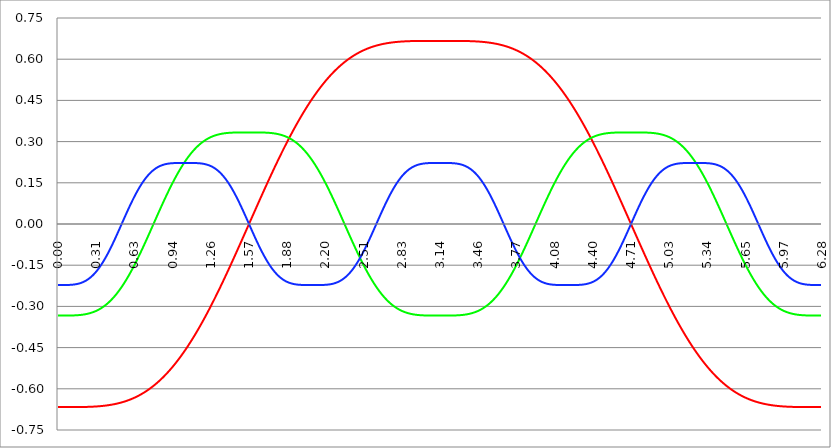
| Category | Series 1 | Series 0 | Series 2 |
|---|---|---|---|
| 0.0 | -0.667 | -0.333 | -0.222 |
| 0.00314159265358979 | -0.667 | -0.333 | -0.222 |
| 0.00628318530717958 | -0.667 | -0.333 | -0.222 |
| 0.00942477796076938 | -0.667 | -0.333 | -0.222 |
| 0.0125663706143592 | -0.667 | -0.333 | -0.222 |
| 0.015707963267949 | -0.667 | -0.333 | -0.222 |
| 0.0188495559215388 | -0.667 | -0.333 | -0.222 |
| 0.0219911485751285 | -0.667 | -0.333 | -0.222 |
| 0.0251327412287183 | -0.667 | -0.333 | -0.222 |
| 0.0282743338823081 | -0.667 | -0.333 | -0.222 |
| 0.0314159265358979 | -0.667 | -0.333 | -0.222 |
| 0.0345575191894877 | -0.667 | -0.333 | -0.222 |
| 0.0376991118430775 | -0.667 | -0.333 | -0.222 |
| 0.0408407044966673 | -0.667 | -0.333 | -0.222 |
| 0.0439822971502571 | -0.667 | -0.333 | -0.222 |
| 0.0471238898038469 | -0.667 | -0.333 | -0.222 |
| 0.0502654824574367 | -0.667 | -0.333 | -0.222 |
| 0.0534070751110265 | -0.667 | -0.333 | -0.222 |
| 0.0565486677646163 | -0.667 | -0.333 | -0.222 |
| 0.059690260418206 | -0.667 | -0.333 | -0.222 |
| 0.0628318530717958 | -0.667 | -0.333 | -0.222 |
| 0.0659734457253856 | -0.667 | -0.333 | -0.222 |
| 0.0691150383789754 | -0.667 | -0.333 | -0.222 |
| 0.0722566310325652 | -0.667 | -0.333 | -0.222 |
| 0.075398223686155 | -0.667 | -0.333 | -0.222 |
| 0.0785398163397448 | -0.667 | -0.333 | -0.222 |
| 0.0816814089933346 | -0.667 | -0.333 | -0.222 |
| 0.0848230016469244 | -0.667 | -0.333 | -0.222 |
| 0.0879645943005142 | -0.667 | -0.333 | -0.222 |
| 0.091106186954104 | -0.667 | -0.333 | -0.222 |
| 0.0942477796076937 | -0.667 | -0.333 | -0.222 |
| 0.0973893722612835 | -0.667 | -0.333 | -0.222 |
| 0.100530964914873 | -0.667 | -0.333 | -0.222 |
| 0.103672557568463 | -0.667 | -0.333 | -0.221 |
| 0.106814150222053 | -0.667 | -0.333 | -0.221 |
| 0.109955742875643 | -0.667 | -0.333 | -0.221 |
| 0.113097335529233 | -0.667 | -0.333 | -0.221 |
| 0.116238928182822 | -0.667 | -0.333 | -0.221 |
| 0.119380520836412 | -0.667 | -0.333 | -0.221 |
| 0.122522113490002 | -0.667 | -0.333 | -0.221 |
| 0.125663706143592 | -0.667 | -0.333 | -0.221 |
| 0.128805298797181 | -0.667 | -0.333 | -0.22 |
| 0.131946891450771 | -0.667 | -0.333 | -0.22 |
| 0.135088484104361 | -0.667 | -0.333 | -0.22 |
| 0.138230076757951 | -0.667 | -0.333 | -0.22 |
| 0.141371669411541 | -0.667 | -0.333 | -0.22 |
| 0.14451326206513 | -0.667 | -0.332 | -0.219 |
| 0.14765485471872 | -0.667 | -0.332 | -0.219 |
| 0.15079644737231 | -0.667 | -0.332 | -0.219 |
| 0.1539380400259 | -0.667 | -0.332 | -0.219 |
| 0.15707963267949 | -0.667 | -0.332 | -0.218 |
| 0.160221225333079 | -0.667 | -0.332 | -0.218 |
| 0.163362817986669 | -0.666 | -0.332 | -0.218 |
| 0.166504410640259 | -0.666 | -0.332 | -0.217 |
| 0.169646003293849 | -0.666 | -0.332 | -0.217 |
| 0.172787595947439 | -0.666 | -0.332 | -0.217 |
| 0.175929188601028 | -0.666 | -0.331 | -0.216 |
| 0.179070781254618 | -0.666 | -0.331 | -0.216 |
| 0.182212373908208 | -0.666 | -0.331 | -0.215 |
| 0.185353966561798 | -0.666 | -0.331 | -0.215 |
| 0.188495559215388 | -0.666 | -0.331 | -0.215 |
| 0.191637151868977 | -0.666 | -0.331 | -0.214 |
| 0.194778744522567 | -0.666 | -0.331 | -0.214 |
| 0.197920337176157 | -0.666 | -0.33 | -0.213 |
| 0.201061929829747 | -0.666 | -0.33 | -0.212 |
| 0.204203522483336 | -0.666 | -0.33 | -0.212 |
| 0.207345115136926 | -0.666 | -0.33 | -0.211 |
| 0.210486707790516 | -0.666 | -0.33 | -0.211 |
| 0.213628300444106 | -0.666 | -0.329 | -0.21 |
| 0.216769893097696 | -0.666 | -0.329 | -0.209 |
| 0.219911485751285 | -0.666 | -0.329 | -0.209 |
| 0.223053078404875 | -0.666 | -0.329 | -0.208 |
| 0.226194671058465 | -0.666 | -0.328 | -0.207 |
| 0.229336263712055 | -0.666 | -0.328 | -0.206 |
| 0.232477856365645 | -0.666 | -0.328 | -0.205 |
| 0.235619449019234 | -0.666 | -0.328 | -0.205 |
| 0.238761041672824 | -0.666 | -0.327 | -0.204 |
| 0.241902634326414 | -0.666 | -0.327 | -0.203 |
| 0.245044226980004 | -0.666 | -0.327 | -0.202 |
| 0.248185819633594 | -0.666 | -0.326 | -0.201 |
| 0.251327412287183 | -0.666 | -0.326 | -0.2 |
| 0.254469004940773 | -0.666 | -0.326 | -0.199 |
| 0.257610597594363 | -0.666 | -0.325 | -0.198 |
| 0.260752190247953 | -0.666 | -0.325 | -0.197 |
| 0.263893782901543 | -0.665 | -0.324 | -0.196 |
| 0.267035375555132 | -0.665 | -0.324 | -0.195 |
| 0.270176968208722 | -0.665 | -0.324 | -0.193 |
| 0.273318560862312 | -0.665 | -0.323 | -0.192 |
| 0.276460153515902 | -0.665 | -0.323 | -0.191 |
| 0.279601746169492 | -0.665 | -0.322 | -0.19 |
| 0.282743338823082 | -0.665 | -0.322 | -0.188 |
| 0.285884931476671 | -0.665 | -0.321 | -0.187 |
| 0.289026524130261 | -0.665 | -0.321 | -0.186 |
| 0.292168116783851 | -0.665 | -0.32 | -0.184 |
| 0.295309709437441 | -0.665 | -0.32 | -0.183 |
| 0.298451302091031 | -0.665 | -0.319 | -0.181 |
| 0.30159289474462 | -0.665 | -0.319 | -0.18 |
| 0.30473448739821 | -0.665 | -0.318 | -0.178 |
| 0.3078760800518 | -0.664 | -0.318 | -0.177 |
| 0.31101767270539 | -0.664 | -0.317 | -0.175 |
| 0.31415926535898 | -0.664 | -0.316 | -0.173 |
| 0.31730085801257 | -0.664 | -0.316 | -0.172 |
| 0.320442450666159 | -0.664 | -0.315 | -0.17 |
| 0.323584043319749 | -0.664 | -0.314 | -0.168 |
| 0.326725635973339 | -0.664 | -0.314 | -0.166 |
| 0.329867228626929 | -0.664 | -0.313 | -0.165 |
| 0.333008821280519 | -0.664 | -0.312 | -0.163 |
| 0.336150413934108 | -0.664 | -0.311 | -0.161 |
| 0.339292006587698 | -0.663 | -0.311 | -0.159 |
| 0.342433599241288 | -0.663 | -0.31 | -0.157 |
| 0.345575191894878 | -0.663 | -0.309 | -0.155 |
| 0.348716784548468 | -0.663 | -0.308 | -0.153 |
| 0.351858377202058 | -0.663 | -0.307 | -0.151 |
| 0.354999969855647 | -0.663 | -0.306 | -0.149 |
| 0.358141562509237 | -0.663 | -0.306 | -0.147 |
| 0.361283155162827 | -0.663 | -0.305 | -0.145 |
| 0.364424747816417 | -0.662 | -0.304 | -0.142 |
| 0.367566340470007 | -0.662 | -0.303 | -0.14 |
| 0.370707933123597 | -0.662 | -0.302 | -0.138 |
| 0.373849525777186 | -0.662 | -0.301 | -0.136 |
| 0.376991118430776 | -0.662 | -0.3 | -0.133 |
| 0.380132711084366 | -0.662 | -0.299 | -0.131 |
| 0.383274303737956 | -0.662 | -0.298 | -0.129 |
| 0.386415896391546 | -0.661 | -0.297 | -0.126 |
| 0.389557489045135 | -0.661 | -0.296 | -0.124 |
| 0.392699081698725 | -0.661 | -0.295 | -0.121 |
| 0.395840674352315 | -0.661 | -0.294 | -0.119 |
| 0.398982267005905 | -0.661 | -0.292 | -0.116 |
| 0.402123859659495 | -0.66 | -0.291 | -0.114 |
| 0.405265452313085 | -0.66 | -0.29 | -0.111 |
| 0.408407044966674 | -0.66 | -0.289 | -0.109 |
| 0.411548637620264 | -0.66 | -0.288 | -0.106 |
| 0.414690230273854 | -0.66 | -0.286 | -0.103 |
| 0.417831822927444 | -0.659 | -0.285 | -0.101 |
| 0.420973415581034 | -0.659 | -0.284 | -0.098 |
| 0.424115008234623 | -0.659 | -0.282 | -0.095 |
| 0.427256600888213 | -0.659 | -0.281 | -0.092 |
| 0.430398193541803 | -0.659 | -0.28 | -0.09 |
| 0.433539786195393 | -0.658 | -0.278 | -0.087 |
| 0.436681378848983 | -0.658 | -0.277 | -0.084 |
| 0.439822971502573 | -0.658 | -0.276 | -0.081 |
| 0.442964564156162 | -0.658 | -0.274 | -0.078 |
| 0.446106156809752 | -0.657 | -0.273 | -0.075 |
| 0.449247749463342 | -0.657 | -0.271 | -0.073 |
| 0.452389342116932 | -0.657 | -0.27 | -0.07 |
| 0.455530934770522 | -0.657 | -0.268 | -0.067 |
| 0.458672527424111 | -0.656 | -0.267 | -0.064 |
| 0.461814120077701 | -0.656 | -0.265 | -0.061 |
| 0.464955712731291 | -0.656 | -0.263 | -0.058 |
| 0.468097305384881 | -0.656 | -0.262 | -0.055 |
| 0.471238898038471 | -0.655 | -0.26 | -0.052 |
| 0.474380490692061 | -0.655 | -0.258 | -0.049 |
| 0.47752208334565 | -0.655 | -0.257 | -0.046 |
| 0.48066367599924 | -0.654 | -0.255 | -0.043 |
| 0.48380526865283 | -0.654 | -0.253 | -0.04 |
| 0.48694686130642 | -0.654 | -0.251 | -0.036 |
| 0.49008845396001 | -0.653 | -0.25 | -0.033 |
| 0.493230046613599 | -0.653 | -0.248 | -0.03 |
| 0.496371639267189 | -0.653 | -0.246 | -0.027 |
| 0.499513231920779 | -0.652 | -0.244 | -0.024 |
| 0.502654824574369 | -0.652 | -0.242 | -0.021 |
| 0.505796417227959 | -0.652 | -0.24 | -0.018 |
| 0.508938009881549 | -0.651 | -0.238 | -0.015 |
| 0.512079602535138 | -0.651 | -0.236 | -0.012 |
| 0.515221195188728 | -0.651 | -0.235 | -0.008 |
| 0.518362787842318 | -0.65 | -0.233 | -0.005 |
| 0.521504380495908 | -0.65 | -0.231 | -0.002 |
| 0.524645973149498 | -0.649 | -0.228 | 0.001 |
| 0.527787565803087 | -0.649 | -0.226 | 0.004 |
| 0.530929158456677 | -0.649 | -0.224 | 0.007 |
| 0.534070751110267 | -0.648 | -0.222 | 0.01 |
| 0.537212343763857 | -0.648 | -0.22 | 0.014 |
| 0.540353936417447 | -0.647 | -0.218 | 0.017 |
| 0.543495529071037 | -0.647 | -0.216 | 0.02 |
| 0.546637121724626 | -0.646 | -0.214 | 0.023 |
| 0.549778714378216 | -0.646 | -0.211 | 0.026 |
| 0.552920307031806 | -0.646 | -0.209 | 0.029 |
| 0.556061899685396 | -0.645 | -0.207 | 0.032 |
| 0.559203492338986 | -0.645 | -0.205 | 0.035 |
| 0.562345084992576 | -0.644 | -0.202 | 0.038 |
| 0.565486677646165 | -0.644 | -0.2 | 0.042 |
| 0.568628270299755 | -0.643 | -0.198 | 0.045 |
| 0.571769862953345 | -0.643 | -0.195 | 0.048 |
| 0.574911455606935 | -0.642 | -0.193 | 0.051 |
| 0.578053048260525 | -0.642 | -0.191 | 0.054 |
| 0.581194640914114 | -0.641 | -0.188 | 0.057 |
| 0.584336233567704 | -0.641 | -0.186 | 0.06 |
| 0.587477826221294 | -0.64 | -0.183 | 0.063 |
| 0.590619418874884 | -0.64 | -0.181 | 0.066 |
| 0.593761011528474 | -0.639 | -0.178 | 0.069 |
| 0.596902604182064 | -0.638 | -0.176 | 0.072 |
| 0.600044196835653 | -0.638 | -0.173 | 0.074 |
| 0.603185789489243 | -0.637 | -0.171 | 0.077 |
| 0.606327382142833 | -0.637 | -0.168 | 0.08 |
| 0.609468974796423 | -0.636 | -0.165 | 0.083 |
| 0.612610567450013 | -0.636 | -0.163 | 0.086 |
| 0.615752160103602 | -0.635 | -0.16 | 0.089 |
| 0.618893752757192 | -0.634 | -0.158 | 0.092 |
| 0.622035345410782 | -0.634 | -0.155 | 0.094 |
| 0.625176938064372 | -0.633 | -0.152 | 0.097 |
| 0.628318530717962 | -0.633 | -0.15 | 0.1 |
| 0.631460123371551 | -0.632 | -0.147 | 0.102 |
| 0.634601716025141 | -0.631 | -0.144 | 0.105 |
| 0.637743308678731 | -0.631 | -0.141 | 0.108 |
| 0.640884901332321 | -0.63 | -0.139 | 0.11 |
| 0.644026493985911 | -0.629 | -0.136 | 0.113 |
| 0.647168086639501 | -0.629 | -0.133 | 0.115 |
| 0.65030967929309 | -0.628 | -0.13 | 0.118 |
| 0.65345127194668 | -0.627 | -0.127 | 0.121 |
| 0.65659286460027 | -0.626 | -0.125 | 0.123 |
| 0.65973445725386 | -0.626 | -0.122 | 0.125 |
| 0.66287604990745 | -0.625 | -0.119 | 0.128 |
| 0.666017642561039 | -0.624 | -0.116 | 0.13 |
| 0.669159235214629 | -0.624 | -0.113 | 0.133 |
| 0.672300827868219 | -0.623 | -0.11 | 0.135 |
| 0.675442420521809 | -0.622 | -0.107 | 0.137 |
| 0.678584013175399 | -0.621 | -0.104 | 0.139 |
| 0.681725605828989 | -0.62 | -0.101 | 0.142 |
| 0.684867198482578 | -0.62 | -0.099 | 0.144 |
| 0.688008791136168 | -0.619 | -0.096 | 0.146 |
| 0.691150383789758 | -0.618 | -0.093 | 0.148 |
| 0.694291976443348 | -0.617 | -0.09 | 0.15 |
| 0.697433569096938 | -0.616 | -0.087 | 0.152 |
| 0.700575161750528 | -0.616 | -0.084 | 0.154 |
| 0.703716754404117 | -0.615 | -0.081 | 0.156 |
| 0.706858347057707 | -0.614 | -0.078 | 0.158 |
| 0.709999939711297 | -0.613 | -0.075 | 0.16 |
| 0.713141532364887 | -0.612 | -0.072 | 0.162 |
| 0.716283125018477 | -0.611 | -0.068 | 0.164 |
| 0.719424717672066 | -0.61 | -0.065 | 0.166 |
| 0.722566310325656 | -0.609 | -0.062 | 0.168 |
| 0.725707902979246 | -0.609 | -0.059 | 0.169 |
| 0.728849495632836 | -0.608 | -0.056 | 0.171 |
| 0.731991088286426 | -0.607 | -0.053 | 0.173 |
| 0.735132680940016 | -0.606 | -0.05 | 0.174 |
| 0.738274273593605 | -0.605 | -0.047 | 0.176 |
| 0.741415866247195 | -0.604 | -0.044 | 0.178 |
| 0.744557458900785 | -0.603 | -0.041 | 0.179 |
| 0.747699051554375 | -0.602 | -0.038 | 0.181 |
| 0.750840644207965 | -0.601 | -0.034 | 0.182 |
| 0.753982236861554 | -0.6 | -0.031 | 0.184 |
| 0.757123829515144 | -0.599 | -0.028 | 0.185 |
| 0.760265422168734 | -0.598 | -0.025 | 0.187 |
| 0.763407014822324 | -0.597 | -0.022 | 0.188 |
| 0.766548607475914 | -0.596 | -0.019 | 0.189 |
| 0.769690200129504 | -0.595 | -0.016 | 0.19 |
| 0.772831792783093 | -0.594 | -0.013 | 0.192 |
| 0.775973385436683 | -0.593 | -0.009 | 0.193 |
| 0.779114978090273 | -0.591 | -0.006 | 0.194 |
| 0.782256570743863 | -0.59 | -0.003 | 0.195 |
| 0.785398163397453 | -0.589 | 0 | 0.196 |
| 0.788539756051042 | -0.588 | 0.003 | 0.198 |
| 0.791681348704632 | -0.587 | 0.006 | 0.199 |
| 0.794822941358222 | -0.586 | 0.009 | 0.2 |
| 0.797964534011812 | -0.585 | 0.013 | 0.201 |
| 0.801106126665402 | -0.584 | 0.016 | 0.202 |
| 0.804247719318992 | -0.582 | 0.019 | 0.203 |
| 0.807389311972581 | -0.581 | 0.022 | 0.203 |
| 0.810530904626171 | -0.58 | 0.025 | 0.204 |
| 0.813672497279761 | -0.579 | 0.028 | 0.205 |
| 0.816814089933351 | -0.578 | 0.031 | 0.206 |
| 0.819955682586941 | -0.576 | 0.034 | 0.207 |
| 0.823097275240531 | -0.575 | 0.038 | 0.208 |
| 0.82623886789412 | -0.574 | 0.041 | 0.208 |
| 0.82938046054771 | -0.573 | 0.044 | 0.209 |
| 0.8325220532013 | -0.571 | 0.047 | 0.21 |
| 0.83566364585489 | -0.57 | 0.05 | 0.21 |
| 0.83880523850848 | -0.569 | 0.053 | 0.211 |
| 0.841946831162069 | -0.568 | 0.056 | 0.212 |
| 0.845088423815659 | -0.566 | 0.059 | 0.212 |
| 0.848230016469249 | -0.565 | 0.062 | 0.213 |
| 0.851371609122839 | -0.564 | 0.065 | 0.213 |
| 0.854513201776429 | -0.562 | 0.068 | 0.214 |
| 0.857654794430019 | -0.561 | 0.072 | 0.214 |
| 0.860796387083608 | -0.56 | 0.075 | 0.215 |
| 0.863937979737198 | -0.558 | 0.078 | 0.215 |
| 0.867079572390788 | -0.557 | 0.081 | 0.216 |
| 0.870221165044378 | -0.555 | 0.084 | 0.216 |
| 0.873362757697968 | -0.554 | 0.087 | 0.217 |
| 0.876504350351557 | -0.553 | 0.09 | 0.217 |
| 0.879645943005147 | -0.551 | 0.093 | 0.217 |
| 0.882787535658737 | -0.55 | 0.096 | 0.218 |
| 0.885929128312327 | -0.548 | 0.099 | 0.218 |
| 0.889070720965917 | -0.547 | 0.101 | 0.218 |
| 0.892212313619507 | -0.545 | 0.104 | 0.219 |
| 0.895353906273096 | -0.544 | 0.107 | 0.219 |
| 0.898495498926686 | -0.542 | 0.11 | 0.219 |
| 0.901637091580276 | -0.541 | 0.113 | 0.219 |
| 0.904778684233866 | -0.539 | 0.116 | 0.22 |
| 0.907920276887456 | -0.538 | 0.119 | 0.22 |
| 0.911061869541045 | -0.536 | 0.122 | 0.22 |
| 0.914203462194635 | -0.535 | 0.125 | 0.22 |
| 0.917345054848225 | -0.533 | 0.127 | 0.22 |
| 0.920486647501815 | -0.531 | 0.13 | 0.221 |
| 0.923628240155405 | -0.53 | 0.133 | 0.221 |
| 0.926769832808995 | -0.528 | 0.136 | 0.221 |
| 0.929911425462584 | -0.527 | 0.139 | 0.221 |
| 0.933053018116174 | -0.525 | 0.141 | 0.221 |
| 0.936194610769764 | -0.523 | 0.144 | 0.221 |
| 0.939336203423354 | -0.522 | 0.147 | 0.221 |
| 0.942477796076944 | -0.52 | 0.15 | 0.221 |
| 0.945619388730533 | -0.518 | 0.152 | 0.222 |
| 0.948760981384123 | -0.517 | 0.155 | 0.222 |
| 0.951902574037713 | -0.515 | 0.158 | 0.222 |
| 0.955044166691303 | -0.513 | 0.16 | 0.222 |
| 0.958185759344893 | -0.512 | 0.163 | 0.222 |
| 0.961327351998483 | -0.51 | 0.165 | 0.222 |
| 0.964468944652072 | -0.508 | 0.168 | 0.222 |
| 0.967610537305662 | -0.506 | 0.171 | 0.222 |
| 0.970752129959252 | -0.505 | 0.173 | 0.222 |
| 0.973893722612842 | -0.503 | 0.176 | 0.222 |
| 0.977035315266432 | -0.501 | 0.178 | 0.222 |
| 0.980176907920022 | -0.499 | 0.181 | 0.222 |
| 0.983318500573611 | -0.498 | 0.183 | 0.222 |
| 0.986460093227201 | -0.496 | 0.186 | 0.222 |
| 0.989601685880791 | -0.494 | 0.188 | 0.222 |
| 0.992743278534381 | -0.492 | 0.191 | 0.222 |
| 0.995884871187971 | -0.49 | 0.193 | 0.222 |
| 0.99902646384156 | -0.488 | 0.195 | 0.222 |
| 1.00216805649515 | -0.486 | 0.198 | 0.222 |
| 1.00530964914874 | -0.485 | 0.2 | 0.222 |
| 1.00845124180233 | -0.483 | 0.202 | 0.222 |
| 1.01159283445592 | -0.481 | 0.205 | 0.222 |
| 1.01473442710951 | -0.479 | 0.207 | 0.222 |
| 1.017876019763099 | -0.477 | 0.209 | 0.222 |
| 1.021017612416689 | -0.475 | 0.211 | 0.222 |
| 1.02415920507028 | -0.473 | 0.214 | 0.222 |
| 1.027300797723869 | -0.471 | 0.216 | 0.222 |
| 1.030442390377459 | -0.469 | 0.218 | 0.222 |
| 1.033583983031048 | -0.467 | 0.22 | 0.222 |
| 1.036725575684638 | -0.465 | 0.222 | 0.222 |
| 1.039867168338228 | -0.463 | 0.224 | 0.222 |
| 1.043008760991818 | -0.461 | 0.226 | 0.222 |
| 1.046150353645408 | -0.459 | 0.228 | 0.222 |
| 1.049291946298998 | -0.457 | 0.231 | 0.222 |
| 1.052433538952587 | -0.455 | 0.233 | 0.222 |
| 1.055575131606177 | -0.453 | 0.235 | 0.222 |
| 1.058716724259767 | -0.451 | 0.236 | 0.222 |
| 1.061858316913357 | -0.449 | 0.238 | 0.222 |
| 1.064999909566947 | -0.447 | 0.24 | 0.222 |
| 1.068141502220536 | -0.444 | 0.242 | 0.222 |
| 1.071283094874126 | -0.442 | 0.244 | 0.222 |
| 1.074424687527716 | -0.44 | 0.246 | 0.222 |
| 1.077566280181306 | -0.438 | 0.248 | 0.222 |
| 1.080707872834896 | -0.436 | 0.25 | 0.222 |
| 1.083849465488486 | -0.434 | 0.251 | 0.222 |
| 1.086991058142075 | -0.432 | 0.253 | 0.222 |
| 1.090132650795665 | -0.429 | 0.255 | 0.222 |
| 1.093274243449255 | -0.427 | 0.257 | 0.222 |
| 1.096415836102845 | -0.425 | 0.258 | 0.222 |
| 1.099557428756435 | -0.423 | 0.26 | 0.222 |
| 1.102699021410025 | -0.421 | 0.262 | 0.222 |
| 1.105840614063614 | -0.418 | 0.263 | 0.222 |
| 1.108982206717204 | -0.416 | 0.265 | 0.222 |
| 1.112123799370794 | -0.414 | 0.267 | 0.222 |
| 1.115265392024384 | -0.412 | 0.268 | 0.222 |
| 1.118406984677974 | -0.409 | 0.27 | 0.222 |
| 1.121548577331563 | -0.407 | 0.271 | 0.222 |
| 1.124690169985153 | -0.405 | 0.273 | 0.222 |
| 1.127831762638743 | -0.402 | 0.274 | 0.222 |
| 1.130973355292333 | -0.4 | 0.276 | 0.222 |
| 1.134114947945923 | -0.398 | 0.277 | 0.222 |
| 1.137256540599513 | -0.395 | 0.278 | 0.222 |
| 1.140398133253102 | -0.393 | 0.28 | 0.222 |
| 1.143539725906692 | -0.391 | 0.281 | 0.222 |
| 1.146681318560282 | -0.388 | 0.282 | 0.222 |
| 1.149822911213872 | -0.386 | 0.284 | 0.221 |
| 1.152964503867462 | -0.384 | 0.285 | 0.221 |
| 1.156106096521051 | -0.381 | 0.286 | 0.221 |
| 1.159247689174641 | -0.379 | 0.288 | 0.221 |
| 1.162389281828231 | -0.376 | 0.289 | 0.221 |
| 1.165530874481821 | -0.374 | 0.29 | 0.221 |
| 1.168672467135411 | -0.371 | 0.291 | 0.221 |
| 1.171814059789001 | -0.369 | 0.292 | 0.221 |
| 1.17495565244259 | -0.366 | 0.294 | 0.221 |
| 1.17809724509618 | -0.364 | 0.295 | 0.22 |
| 1.18123883774977 | -0.362 | 0.296 | 0.22 |
| 1.18438043040336 | -0.359 | 0.297 | 0.22 |
| 1.18752202305695 | -0.357 | 0.298 | 0.22 |
| 1.190663615710539 | -0.354 | 0.299 | 0.22 |
| 1.193805208364129 | -0.351 | 0.3 | 0.219 |
| 1.19694680101772 | -0.349 | 0.301 | 0.219 |
| 1.200088393671309 | -0.346 | 0.302 | 0.219 |
| 1.203229986324899 | -0.344 | 0.303 | 0.219 |
| 1.206371578978489 | -0.341 | 0.304 | 0.218 |
| 1.209513171632078 | -0.339 | 0.305 | 0.218 |
| 1.212654764285668 | -0.336 | 0.306 | 0.218 |
| 1.215796356939258 | -0.334 | 0.306 | 0.217 |
| 1.218937949592848 | -0.331 | 0.307 | 0.217 |
| 1.222079542246438 | -0.328 | 0.308 | 0.216 |
| 1.225221134900027 | -0.326 | 0.309 | 0.216 |
| 1.228362727553617 | -0.323 | 0.31 | 0.216 |
| 1.231504320207207 | -0.321 | 0.311 | 0.215 |
| 1.234645912860797 | -0.318 | 0.311 | 0.215 |
| 1.237787505514387 | -0.315 | 0.312 | 0.214 |
| 1.240929098167977 | -0.313 | 0.313 | 0.214 |
| 1.244070690821566 | -0.31 | 0.314 | 0.213 |
| 1.247212283475156 | -0.307 | 0.314 | 0.213 |
| 1.250353876128746 | -0.305 | 0.315 | 0.212 |
| 1.253495468782336 | -0.302 | 0.316 | 0.211 |
| 1.256637061435926 | -0.299 | 0.316 | 0.211 |
| 1.259778654089515 | -0.296 | 0.317 | 0.21 |
| 1.262920246743105 | -0.294 | 0.318 | 0.21 |
| 1.266061839396695 | -0.291 | 0.318 | 0.209 |
| 1.269203432050285 | -0.288 | 0.319 | 0.208 |
| 1.272345024703875 | -0.286 | 0.319 | 0.207 |
| 1.275486617357465 | -0.283 | 0.32 | 0.207 |
| 1.278628210011054 | -0.28 | 0.32 | 0.206 |
| 1.281769802664644 | -0.277 | 0.321 | 0.205 |
| 1.284911395318234 | -0.275 | 0.321 | 0.204 |
| 1.288052987971824 | -0.272 | 0.322 | 0.203 |
| 1.291194580625414 | -0.269 | 0.322 | 0.202 |
| 1.294336173279003 | -0.266 | 0.323 | 0.201 |
| 1.297477765932593 | -0.263 | 0.323 | 0.2 |
| 1.300619358586183 | -0.261 | 0.324 | 0.199 |
| 1.303760951239773 | -0.258 | 0.324 | 0.198 |
| 1.306902543893363 | -0.255 | 0.324 | 0.197 |
| 1.310044136546953 | -0.252 | 0.325 | 0.196 |
| 1.313185729200542 | -0.249 | 0.325 | 0.195 |
| 1.316327321854132 | -0.246 | 0.326 | 0.194 |
| 1.319468914507722 | -0.244 | 0.326 | 0.193 |
| 1.322610507161312 | -0.241 | 0.326 | 0.191 |
| 1.325752099814902 | -0.238 | 0.327 | 0.19 |
| 1.328893692468491 | -0.235 | 0.327 | 0.189 |
| 1.332035285122081 | -0.232 | 0.327 | 0.187 |
| 1.335176877775671 | -0.229 | 0.328 | 0.186 |
| 1.338318470429261 | -0.226 | 0.328 | 0.185 |
| 1.341460063082851 | -0.223 | 0.328 | 0.183 |
| 1.344601655736441 | -0.221 | 0.328 | 0.182 |
| 1.34774324839003 | -0.218 | 0.329 | 0.18 |
| 1.35088484104362 | -0.215 | 0.329 | 0.179 |
| 1.35402643369721 | -0.212 | 0.329 | 0.177 |
| 1.3571680263508 | -0.209 | 0.329 | 0.176 |
| 1.36030961900439 | -0.206 | 0.33 | 0.174 |
| 1.363451211657979 | -0.203 | 0.33 | 0.172 |
| 1.36659280431157 | -0.2 | 0.33 | 0.171 |
| 1.369734396965159 | -0.197 | 0.33 | 0.169 |
| 1.372875989618749 | -0.194 | 0.33 | 0.167 |
| 1.376017582272339 | -0.191 | 0.331 | 0.165 |
| 1.379159174925929 | -0.188 | 0.331 | 0.163 |
| 1.382300767579518 | -0.185 | 0.331 | 0.162 |
| 1.385442360233108 | -0.182 | 0.331 | 0.16 |
| 1.388583952886698 | -0.179 | 0.331 | 0.158 |
| 1.391725545540288 | -0.176 | 0.331 | 0.156 |
| 1.394867138193878 | -0.173 | 0.331 | 0.154 |
| 1.398008730847468 | -0.17 | 0.332 | 0.152 |
| 1.401150323501057 | -0.167 | 0.332 | 0.15 |
| 1.404291916154647 | -0.164 | 0.332 | 0.147 |
| 1.407433508808237 | -0.161 | 0.332 | 0.145 |
| 1.410575101461827 | -0.158 | 0.332 | 0.143 |
| 1.413716694115417 | -0.155 | 0.332 | 0.141 |
| 1.416858286769006 | -0.152 | 0.332 | 0.139 |
| 1.419999879422596 | -0.149 | 0.332 | 0.136 |
| 1.423141472076186 | -0.146 | 0.332 | 0.134 |
| 1.426283064729776 | -0.143 | 0.332 | 0.132 |
| 1.429424657383366 | -0.14 | 0.333 | 0.129 |
| 1.432566250036956 | -0.137 | 0.333 | 0.127 |
| 1.435707842690545 | -0.134 | 0.333 | 0.125 |
| 1.438849435344135 | -0.131 | 0.333 | 0.122 |
| 1.441991027997725 | -0.128 | 0.333 | 0.12 |
| 1.445132620651315 | -0.125 | 0.333 | 0.117 |
| 1.448274213304905 | -0.122 | 0.333 | 0.115 |
| 1.451415805958494 | -0.119 | 0.333 | 0.112 |
| 1.454557398612084 | -0.115 | 0.333 | 0.109 |
| 1.457698991265674 | -0.112 | 0.333 | 0.107 |
| 1.460840583919264 | -0.109 | 0.333 | 0.104 |
| 1.463982176572854 | -0.106 | 0.333 | 0.102 |
| 1.467123769226444 | -0.103 | 0.333 | 0.099 |
| 1.470265361880033 | -0.1 | 0.333 | 0.096 |
| 1.473406954533623 | -0.097 | 0.333 | 0.093 |
| 1.476548547187213 | -0.094 | 0.333 | 0.091 |
| 1.479690139840803 | -0.091 | 0.333 | 0.088 |
| 1.482831732494393 | -0.088 | 0.333 | 0.085 |
| 1.485973325147982 | -0.085 | 0.333 | 0.082 |
| 1.489114917801572 | -0.081 | 0.333 | 0.079 |
| 1.492256510455162 | -0.078 | 0.333 | 0.076 |
| 1.495398103108752 | -0.075 | 0.333 | 0.074 |
| 1.498539695762342 | -0.072 | 0.333 | 0.071 |
| 1.501681288415932 | -0.069 | 0.333 | 0.068 |
| 1.504822881069521 | -0.066 | 0.333 | 0.065 |
| 1.507964473723111 | -0.063 | 0.333 | 0.062 |
| 1.511106066376701 | -0.06 | 0.333 | 0.059 |
| 1.514247659030291 | -0.056 | 0.333 | 0.056 |
| 1.517389251683881 | -0.053 | 0.333 | 0.053 |
| 1.520530844337471 | -0.05 | 0.333 | 0.05 |
| 1.52367243699106 | -0.047 | 0.333 | 0.047 |
| 1.52681402964465 | -0.044 | 0.333 | 0.044 |
| 1.52995562229824 | -0.041 | 0.333 | 0.041 |
| 1.53309721495183 | -0.038 | 0.333 | 0.037 |
| 1.53623880760542 | -0.035 | 0.333 | 0.034 |
| 1.539380400259009 | -0.031 | 0.333 | 0.031 |
| 1.542521992912599 | -0.028 | 0.333 | 0.028 |
| 1.545663585566189 | -0.025 | 0.333 | 0.025 |
| 1.548805178219779 | -0.022 | 0.333 | 0.022 |
| 1.551946770873369 | -0.019 | 0.333 | 0.019 |
| 1.555088363526959 | -0.016 | 0.333 | 0.016 |
| 1.558229956180548 | -0.013 | 0.333 | 0.013 |
| 1.561371548834138 | -0.009 | 0.333 | 0.009 |
| 1.564513141487728 | -0.006 | 0.333 | 0.006 |
| 1.567654734141318 | -0.003 | 0.333 | 0.003 |
| 1.570796326794908 | 0 | 0.333 | 0 |
| 1.573937919448497 | 0.003 | 0.333 | -0.003 |
| 1.577079512102087 | 0.006 | 0.333 | -0.006 |
| 1.580221104755677 | 0.009 | 0.333 | -0.009 |
| 1.583362697409267 | 0.013 | 0.333 | -0.013 |
| 1.586504290062857 | 0.016 | 0.333 | -0.016 |
| 1.589645882716447 | 0.019 | 0.333 | -0.019 |
| 1.592787475370036 | 0.022 | 0.333 | -0.022 |
| 1.595929068023626 | 0.025 | 0.333 | -0.025 |
| 1.599070660677216 | 0.028 | 0.333 | -0.028 |
| 1.602212253330806 | 0.031 | 0.333 | -0.031 |
| 1.605353845984396 | 0.035 | 0.333 | -0.034 |
| 1.608495438637985 | 0.038 | 0.333 | -0.037 |
| 1.611637031291575 | 0.041 | 0.333 | -0.041 |
| 1.614778623945165 | 0.044 | 0.333 | -0.044 |
| 1.617920216598755 | 0.047 | 0.333 | -0.047 |
| 1.621061809252345 | 0.05 | 0.333 | -0.05 |
| 1.624203401905935 | 0.053 | 0.333 | -0.053 |
| 1.627344994559524 | 0.056 | 0.333 | -0.056 |
| 1.630486587213114 | 0.06 | 0.333 | -0.059 |
| 1.633628179866704 | 0.063 | 0.333 | -0.062 |
| 1.636769772520294 | 0.066 | 0.333 | -0.065 |
| 1.639911365173884 | 0.069 | 0.333 | -0.068 |
| 1.643052957827473 | 0.072 | 0.333 | -0.071 |
| 1.646194550481063 | 0.075 | 0.333 | -0.074 |
| 1.649336143134653 | 0.078 | 0.333 | -0.076 |
| 1.652477735788243 | 0.081 | 0.333 | -0.079 |
| 1.655619328441833 | 0.085 | 0.333 | -0.082 |
| 1.658760921095423 | 0.088 | 0.333 | -0.085 |
| 1.661902513749012 | 0.091 | 0.333 | -0.088 |
| 1.665044106402602 | 0.094 | 0.333 | -0.091 |
| 1.668185699056192 | 0.097 | 0.333 | -0.093 |
| 1.671327291709782 | 0.1 | 0.333 | -0.096 |
| 1.674468884363372 | 0.103 | 0.333 | -0.099 |
| 1.677610477016961 | 0.106 | 0.333 | -0.102 |
| 1.680752069670551 | 0.109 | 0.333 | -0.104 |
| 1.683893662324141 | 0.112 | 0.333 | -0.107 |
| 1.687035254977731 | 0.115 | 0.333 | -0.109 |
| 1.690176847631321 | 0.119 | 0.333 | -0.112 |
| 1.693318440284911 | 0.122 | 0.333 | -0.115 |
| 1.6964600329385 | 0.125 | 0.333 | -0.117 |
| 1.69960162559209 | 0.128 | 0.333 | -0.12 |
| 1.70274321824568 | 0.131 | 0.333 | -0.122 |
| 1.70588481089927 | 0.134 | 0.333 | -0.125 |
| 1.70902640355286 | 0.137 | 0.333 | -0.127 |
| 1.712167996206449 | 0.14 | 0.333 | -0.129 |
| 1.715309588860039 | 0.143 | 0.332 | -0.132 |
| 1.71845118151363 | 0.146 | 0.332 | -0.134 |
| 1.721592774167219 | 0.149 | 0.332 | -0.136 |
| 1.724734366820809 | 0.152 | 0.332 | -0.139 |
| 1.727875959474399 | 0.155 | 0.332 | -0.141 |
| 1.731017552127988 | 0.158 | 0.332 | -0.143 |
| 1.734159144781578 | 0.161 | 0.332 | -0.145 |
| 1.737300737435168 | 0.164 | 0.332 | -0.147 |
| 1.740442330088758 | 0.167 | 0.332 | -0.15 |
| 1.743583922742348 | 0.17 | 0.332 | -0.152 |
| 1.746725515395937 | 0.173 | 0.331 | -0.154 |
| 1.749867108049527 | 0.176 | 0.331 | -0.156 |
| 1.753008700703117 | 0.179 | 0.331 | -0.158 |
| 1.756150293356707 | 0.182 | 0.331 | -0.16 |
| 1.759291886010297 | 0.185 | 0.331 | -0.162 |
| 1.762433478663887 | 0.188 | 0.331 | -0.163 |
| 1.765575071317476 | 0.191 | 0.331 | -0.165 |
| 1.768716663971066 | 0.194 | 0.33 | -0.167 |
| 1.771858256624656 | 0.197 | 0.33 | -0.169 |
| 1.774999849278246 | 0.2 | 0.33 | -0.171 |
| 1.778141441931836 | 0.203 | 0.33 | -0.172 |
| 1.781283034585426 | 0.206 | 0.33 | -0.174 |
| 1.784424627239015 | 0.209 | 0.329 | -0.176 |
| 1.787566219892605 | 0.212 | 0.329 | -0.177 |
| 1.790707812546195 | 0.215 | 0.329 | -0.179 |
| 1.793849405199785 | 0.218 | 0.329 | -0.18 |
| 1.796990997853375 | 0.221 | 0.328 | -0.182 |
| 1.800132590506964 | 0.223 | 0.328 | -0.183 |
| 1.803274183160554 | 0.226 | 0.328 | -0.185 |
| 1.806415775814144 | 0.229 | 0.328 | -0.186 |
| 1.809557368467734 | 0.232 | 0.327 | -0.187 |
| 1.812698961121324 | 0.235 | 0.327 | -0.189 |
| 1.815840553774914 | 0.238 | 0.327 | -0.19 |
| 1.818982146428503 | 0.241 | 0.326 | -0.191 |
| 1.822123739082093 | 0.244 | 0.326 | -0.193 |
| 1.825265331735683 | 0.246 | 0.326 | -0.194 |
| 1.828406924389273 | 0.249 | 0.325 | -0.195 |
| 1.831548517042863 | 0.252 | 0.325 | -0.196 |
| 1.834690109696452 | 0.255 | 0.324 | -0.197 |
| 1.837831702350042 | 0.258 | 0.324 | -0.198 |
| 1.840973295003632 | 0.261 | 0.324 | -0.199 |
| 1.844114887657222 | 0.263 | 0.323 | -0.2 |
| 1.847256480310812 | 0.266 | 0.323 | -0.201 |
| 1.850398072964402 | 0.269 | 0.322 | -0.202 |
| 1.853539665617991 | 0.272 | 0.322 | -0.203 |
| 1.856681258271581 | 0.275 | 0.321 | -0.204 |
| 1.859822850925171 | 0.277 | 0.321 | -0.205 |
| 1.862964443578761 | 0.28 | 0.32 | -0.206 |
| 1.866106036232351 | 0.283 | 0.32 | -0.207 |
| 1.86924762888594 | 0.286 | 0.319 | -0.207 |
| 1.87238922153953 | 0.288 | 0.319 | -0.208 |
| 1.87553081419312 | 0.291 | 0.318 | -0.209 |
| 1.87867240684671 | 0.294 | 0.318 | -0.21 |
| 1.8818139995003 | 0.296 | 0.317 | -0.21 |
| 1.88495559215389 | 0.299 | 0.316 | -0.211 |
| 1.888097184807479 | 0.302 | 0.316 | -0.211 |
| 1.891238777461069 | 0.305 | 0.315 | -0.212 |
| 1.89438037011466 | 0.307 | 0.314 | -0.213 |
| 1.897521962768249 | 0.31 | 0.314 | -0.213 |
| 1.900663555421839 | 0.313 | 0.313 | -0.214 |
| 1.903805148075429 | 0.315 | 0.312 | -0.214 |
| 1.906946740729018 | 0.318 | 0.311 | -0.215 |
| 1.910088333382608 | 0.321 | 0.311 | -0.215 |
| 1.913229926036198 | 0.323 | 0.31 | -0.216 |
| 1.916371518689788 | 0.326 | 0.309 | -0.216 |
| 1.919513111343378 | 0.328 | 0.308 | -0.216 |
| 1.922654703996967 | 0.331 | 0.307 | -0.217 |
| 1.925796296650557 | 0.334 | 0.306 | -0.217 |
| 1.928937889304147 | 0.336 | 0.306 | -0.218 |
| 1.932079481957737 | 0.339 | 0.305 | -0.218 |
| 1.935221074611327 | 0.341 | 0.304 | -0.218 |
| 1.938362667264917 | 0.344 | 0.303 | -0.219 |
| 1.941504259918506 | 0.346 | 0.302 | -0.219 |
| 1.944645852572096 | 0.349 | 0.301 | -0.219 |
| 1.947787445225686 | 0.351 | 0.3 | -0.219 |
| 1.950929037879276 | 0.354 | 0.299 | -0.22 |
| 1.954070630532866 | 0.357 | 0.298 | -0.22 |
| 1.957212223186455 | 0.359 | 0.297 | -0.22 |
| 1.960353815840045 | 0.362 | 0.296 | -0.22 |
| 1.963495408493635 | 0.364 | 0.295 | -0.22 |
| 1.966637001147225 | 0.366 | 0.294 | -0.221 |
| 1.969778593800815 | 0.369 | 0.292 | -0.221 |
| 1.972920186454405 | 0.371 | 0.291 | -0.221 |
| 1.976061779107994 | 0.374 | 0.29 | -0.221 |
| 1.979203371761584 | 0.376 | 0.289 | -0.221 |
| 1.982344964415174 | 0.379 | 0.288 | -0.221 |
| 1.985486557068764 | 0.381 | 0.286 | -0.221 |
| 1.988628149722354 | 0.384 | 0.285 | -0.221 |
| 1.991769742375943 | 0.386 | 0.284 | -0.221 |
| 1.994911335029533 | 0.388 | 0.282 | -0.222 |
| 1.998052927683123 | 0.391 | 0.281 | -0.222 |
| 2.001194520336712 | 0.393 | 0.28 | -0.222 |
| 2.004336112990302 | 0.395 | 0.278 | -0.222 |
| 2.007477705643892 | 0.398 | 0.277 | -0.222 |
| 2.010619298297482 | 0.4 | 0.276 | -0.222 |
| 2.013760890951071 | 0.402 | 0.274 | -0.222 |
| 2.016902483604661 | 0.405 | 0.273 | -0.222 |
| 2.02004407625825 | 0.407 | 0.271 | -0.222 |
| 2.02318566891184 | 0.409 | 0.27 | -0.222 |
| 2.02632726156543 | 0.412 | 0.268 | -0.222 |
| 2.029468854219019 | 0.414 | 0.267 | -0.222 |
| 2.032610446872609 | 0.416 | 0.265 | -0.222 |
| 2.035752039526198 | 0.418 | 0.263 | -0.222 |
| 2.038893632179788 | 0.421 | 0.262 | -0.222 |
| 2.042035224833378 | 0.423 | 0.26 | -0.222 |
| 2.045176817486967 | 0.425 | 0.258 | -0.222 |
| 2.048318410140557 | 0.427 | 0.257 | -0.222 |
| 2.051460002794146 | 0.429 | 0.255 | -0.222 |
| 2.054601595447736 | 0.432 | 0.253 | -0.222 |
| 2.057743188101325 | 0.434 | 0.251 | -0.222 |
| 2.060884780754915 | 0.436 | 0.25 | -0.222 |
| 2.064026373408505 | 0.438 | 0.248 | -0.222 |
| 2.067167966062094 | 0.44 | 0.246 | -0.222 |
| 2.070309558715684 | 0.442 | 0.244 | -0.222 |
| 2.073451151369273 | 0.444 | 0.242 | -0.222 |
| 2.076592744022863 | 0.447 | 0.24 | -0.222 |
| 2.079734336676452 | 0.449 | 0.238 | -0.222 |
| 2.082875929330042 | 0.451 | 0.236 | -0.222 |
| 2.086017521983632 | 0.453 | 0.235 | -0.222 |
| 2.089159114637221 | 0.455 | 0.233 | -0.222 |
| 2.092300707290811 | 0.457 | 0.231 | -0.222 |
| 2.095442299944401 | 0.459 | 0.228 | -0.222 |
| 2.09858389259799 | 0.461 | 0.226 | -0.222 |
| 2.10172548525158 | 0.463 | 0.224 | -0.222 |
| 2.104867077905169 | 0.465 | 0.222 | -0.222 |
| 2.108008670558759 | 0.467 | 0.22 | -0.222 |
| 2.111150263212349 | 0.469 | 0.218 | -0.222 |
| 2.114291855865938 | 0.471 | 0.216 | -0.222 |
| 2.117433448519528 | 0.473 | 0.214 | -0.222 |
| 2.120575041173117 | 0.475 | 0.211 | -0.222 |
| 2.123716633826707 | 0.477 | 0.209 | -0.222 |
| 2.126858226480297 | 0.479 | 0.207 | -0.222 |
| 2.129999819133886 | 0.481 | 0.205 | -0.222 |
| 2.133141411787476 | 0.483 | 0.202 | -0.222 |
| 2.136283004441065 | 0.485 | 0.2 | -0.222 |
| 2.139424597094655 | 0.486 | 0.198 | -0.222 |
| 2.142566189748245 | 0.488 | 0.195 | -0.222 |
| 2.145707782401834 | 0.49 | 0.193 | -0.222 |
| 2.148849375055424 | 0.492 | 0.191 | -0.222 |
| 2.151990967709013 | 0.494 | 0.188 | -0.222 |
| 2.155132560362603 | 0.496 | 0.186 | -0.222 |
| 2.158274153016193 | 0.498 | 0.183 | -0.222 |
| 2.161415745669782 | 0.499 | 0.181 | -0.222 |
| 2.164557338323372 | 0.501 | 0.178 | -0.222 |
| 2.167698930976961 | 0.503 | 0.176 | -0.222 |
| 2.170840523630551 | 0.505 | 0.173 | -0.222 |
| 2.173982116284141 | 0.506 | 0.171 | -0.222 |
| 2.17712370893773 | 0.508 | 0.168 | -0.222 |
| 2.18026530159132 | 0.51 | 0.165 | -0.222 |
| 2.183406894244909 | 0.512 | 0.163 | -0.222 |
| 2.186548486898499 | 0.513 | 0.16 | -0.222 |
| 2.189690079552089 | 0.515 | 0.158 | -0.222 |
| 2.192831672205678 | 0.517 | 0.155 | -0.222 |
| 2.195973264859268 | 0.518 | 0.152 | -0.222 |
| 2.199114857512857 | 0.52 | 0.15 | -0.221 |
| 2.202256450166447 | 0.522 | 0.147 | -0.221 |
| 2.205398042820036 | 0.523 | 0.144 | -0.221 |
| 2.208539635473626 | 0.525 | 0.141 | -0.221 |
| 2.211681228127216 | 0.527 | 0.139 | -0.221 |
| 2.214822820780805 | 0.528 | 0.136 | -0.221 |
| 2.217964413434395 | 0.53 | 0.133 | -0.221 |
| 2.221106006087984 | 0.531 | 0.13 | -0.221 |
| 2.224247598741574 | 0.533 | 0.127 | -0.22 |
| 2.227389191395164 | 0.535 | 0.125 | -0.22 |
| 2.230530784048753 | 0.536 | 0.122 | -0.22 |
| 2.233672376702343 | 0.538 | 0.119 | -0.22 |
| 2.236813969355933 | 0.539 | 0.116 | -0.22 |
| 2.239955562009522 | 0.541 | 0.113 | -0.219 |
| 2.243097154663112 | 0.542 | 0.11 | -0.219 |
| 2.246238747316701 | 0.544 | 0.107 | -0.219 |
| 2.249380339970291 | 0.545 | 0.104 | -0.219 |
| 2.252521932623881 | 0.547 | 0.101 | -0.218 |
| 2.25566352527747 | 0.548 | 0.099 | -0.218 |
| 2.25880511793106 | 0.55 | 0.096 | -0.218 |
| 2.261946710584649 | 0.551 | 0.093 | -0.217 |
| 2.265088303238239 | 0.553 | 0.09 | -0.217 |
| 2.268229895891829 | 0.554 | 0.087 | -0.217 |
| 2.271371488545418 | 0.555 | 0.084 | -0.216 |
| 2.274513081199008 | 0.557 | 0.081 | -0.216 |
| 2.277654673852597 | 0.558 | 0.078 | -0.215 |
| 2.280796266506186 | 0.56 | 0.075 | -0.215 |
| 2.283937859159776 | 0.561 | 0.072 | -0.214 |
| 2.287079451813366 | 0.562 | 0.068 | -0.214 |
| 2.290221044466955 | 0.564 | 0.065 | -0.213 |
| 2.293362637120545 | 0.565 | 0.062 | -0.213 |
| 2.296504229774135 | 0.566 | 0.059 | -0.212 |
| 2.299645822427724 | 0.568 | 0.056 | -0.212 |
| 2.302787415081314 | 0.569 | 0.053 | -0.211 |
| 2.305929007734904 | 0.57 | 0.05 | -0.21 |
| 2.309070600388493 | 0.571 | 0.047 | -0.21 |
| 2.312212193042083 | 0.573 | 0.044 | -0.209 |
| 2.315353785695672 | 0.574 | 0.041 | -0.208 |
| 2.318495378349262 | 0.575 | 0.038 | -0.208 |
| 2.321636971002852 | 0.576 | 0.034 | -0.207 |
| 2.324778563656441 | 0.578 | 0.031 | -0.206 |
| 2.327920156310031 | 0.579 | 0.028 | -0.205 |
| 2.33106174896362 | 0.58 | 0.025 | -0.204 |
| 2.33420334161721 | 0.581 | 0.022 | -0.203 |
| 2.3373449342708 | 0.582 | 0.019 | -0.203 |
| 2.340486526924389 | 0.584 | 0.016 | -0.202 |
| 2.343628119577979 | 0.585 | 0.013 | -0.201 |
| 2.346769712231568 | 0.586 | 0.009 | -0.2 |
| 2.349911304885158 | 0.587 | 0.006 | -0.199 |
| 2.353052897538748 | 0.588 | 0.003 | -0.198 |
| 2.356194490192337 | 0.589 | 0 | -0.196 |
| 2.359336082845927 | 0.59 | -0.003 | -0.195 |
| 2.362477675499516 | 0.591 | -0.006 | -0.194 |
| 2.365619268153106 | 0.593 | -0.009 | -0.193 |
| 2.368760860806696 | 0.594 | -0.013 | -0.192 |
| 2.371902453460285 | 0.595 | -0.016 | -0.19 |
| 2.375044046113875 | 0.596 | -0.019 | -0.189 |
| 2.378185638767464 | 0.597 | -0.022 | -0.188 |
| 2.381327231421054 | 0.598 | -0.025 | -0.187 |
| 2.384468824074644 | 0.599 | -0.028 | -0.185 |
| 2.387610416728233 | 0.6 | -0.031 | -0.184 |
| 2.390752009381823 | 0.601 | -0.034 | -0.182 |
| 2.393893602035412 | 0.602 | -0.038 | -0.181 |
| 2.397035194689002 | 0.603 | -0.041 | -0.179 |
| 2.400176787342591 | 0.604 | -0.044 | -0.178 |
| 2.403318379996181 | 0.605 | -0.047 | -0.176 |
| 2.406459972649771 | 0.606 | -0.05 | -0.174 |
| 2.40960156530336 | 0.607 | -0.053 | -0.173 |
| 2.41274315795695 | 0.608 | -0.056 | -0.171 |
| 2.41588475061054 | 0.609 | -0.059 | -0.169 |
| 2.419026343264129 | 0.609 | -0.062 | -0.168 |
| 2.422167935917719 | 0.61 | -0.065 | -0.166 |
| 2.425309528571308 | 0.611 | -0.068 | -0.164 |
| 2.428451121224898 | 0.612 | -0.072 | -0.162 |
| 2.431592713878488 | 0.613 | -0.075 | -0.16 |
| 2.434734306532077 | 0.614 | -0.078 | -0.158 |
| 2.437875899185667 | 0.615 | -0.081 | -0.156 |
| 2.441017491839256 | 0.616 | -0.084 | -0.154 |
| 2.444159084492846 | 0.616 | -0.087 | -0.152 |
| 2.447300677146435 | 0.617 | -0.09 | -0.15 |
| 2.450442269800025 | 0.618 | -0.093 | -0.148 |
| 2.453583862453615 | 0.619 | -0.096 | -0.146 |
| 2.456725455107204 | 0.62 | -0.099 | -0.144 |
| 2.459867047760794 | 0.62 | -0.101 | -0.142 |
| 2.463008640414384 | 0.621 | -0.104 | -0.139 |
| 2.466150233067973 | 0.622 | -0.107 | -0.137 |
| 2.469291825721563 | 0.623 | -0.11 | -0.135 |
| 2.472433418375152 | 0.624 | -0.113 | -0.133 |
| 2.475575011028742 | 0.624 | -0.116 | -0.13 |
| 2.478716603682332 | 0.625 | -0.119 | -0.128 |
| 2.481858196335921 | 0.626 | -0.122 | -0.125 |
| 2.48499978898951 | 0.626 | -0.125 | -0.123 |
| 2.4881413816431 | 0.627 | -0.127 | -0.121 |
| 2.49128297429669 | 0.628 | -0.13 | -0.118 |
| 2.49442456695028 | 0.629 | -0.133 | -0.115 |
| 2.497566159603869 | 0.629 | -0.136 | -0.113 |
| 2.500707752257458 | 0.63 | -0.139 | -0.11 |
| 2.503849344911048 | 0.631 | -0.141 | -0.108 |
| 2.506990937564638 | 0.631 | -0.144 | -0.105 |
| 2.510132530218228 | 0.632 | -0.147 | -0.102 |
| 2.513274122871817 | 0.633 | -0.15 | -0.1 |
| 2.516415715525407 | 0.633 | -0.152 | -0.097 |
| 2.519557308178996 | 0.634 | -0.155 | -0.094 |
| 2.522698900832586 | 0.634 | -0.158 | -0.092 |
| 2.525840493486176 | 0.635 | -0.16 | -0.089 |
| 2.528982086139765 | 0.636 | -0.163 | -0.086 |
| 2.532123678793355 | 0.636 | -0.165 | -0.083 |
| 2.535265271446944 | 0.637 | -0.168 | -0.08 |
| 2.538406864100534 | 0.637 | -0.171 | -0.077 |
| 2.541548456754124 | 0.638 | -0.173 | -0.074 |
| 2.544690049407713 | 0.638 | -0.176 | -0.072 |
| 2.547831642061302 | 0.639 | -0.178 | -0.069 |
| 2.550973234714892 | 0.64 | -0.181 | -0.066 |
| 2.554114827368482 | 0.64 | -0.183 | -0.063 |
| 2.557256420022072 | 0.641 | -0.186 | -0.06 |
| 2.560398012675661 | 0.641 | -0.188 | -0.057 |
| 2.563539605329251 | 0.642 | -0.191 | -0.054 |
| 2.56668119798284 | 0.642 | -0.193 | -0.051 |
| 2.56982279063643 | 0.643 | -0.195 | -0.048 |
| 2.57296438329002 | 0.643 | -0.198 | -0.045 |
| 2.576105975943609 | 0.644 | -0.2 | -0.042 |
| 2.579247568597199 | 0.644 | -0.202 | -0.038 |
| 2.582389161250788 | 0.645 | -0.205 | -0.035 |
| 2.585530753904377 | 0.645 | -0.207 | -0.032 |
| 2.588672346557967 | 0.646 | -0.209 | -0.029 |
| 2.591813939211557 | 0.646 | -0.211 | -0.026 |
| 2.594955531865147 | 0.646 | -0.214 | -0.023 |
| 2.598097124518736 | 0.647 | -0.216 | -0.02 |
| 2.601238717172326 | 0.647 | -0.218 | -0.017 |
| 2.604380309825915 | 0.648 | -0.22 | -0.014 |
| 2.607521902479505 | 0.648 | -0.222 | -0.01 |
| 2.610663495133095 | 0.649 | -0.224 | -0.007 |
| 2.613805087786684 | 0.649 | -0.226 | -0.004 |
| 2.616946680440274 | 0.649 | -0.228 | -0.001 |
| 2.620088273093863 | 0.65 | -0.231 | 0.002 |
| 2.623229865747452 | 0.65 | -0.233 | 0.005 |
| 2.626371458401042 | 0.651 | -0.235 | 0.008 |
| 2.629513051054632 | 0.651 | -0.236 | 0.012 |
| 2.632654643708222 | 0.651 | -0.238 | 0.015 |
| 2.635796236361811 | 0.652 | -0.24 | 0.018 |
| 2.638937829015401 | 0.652 | -0.242 | 0.021 |
| 2.642079421668991 | 0.652 | -0.244 | 0.024 |
| 2.64522101432258 | 0.653 | -0.246 | 0.027 |
| 2.64836260697617 | 0.653 | -0.248 | 0.03 |
| 2.651504199629759 | 0.653 | -0.25 | 0.033 |
| 2.654645792283349 | 0.654 | -0.251 | 0.036 |
| 2.657787384936938 | 0.654 | -0.253 | 0.04 |
| 2.660928977590528 | 0.654 | -0.255 | 0.043 |
| 2.664070570244118 | 0.655 | -0.257 | 0.046 |
| 2.667212162897707 | 0.655 | -0.258 | 0.049 |
| 2.670353755551297 | 0.655 | -0.26 | 0.052 |
| 2.673495348204887 | 0.656 | -0.262 | 0.055 |
| 2.676636940858476 | 0.656 | -0.263 | 0.058 |
| 2.679778533512066 | 0.656 | -0.265 | 0.061 |
| 2.682920126165655 | 0.656 | -0.267 | 0.064 |
| 2.686061718819245 | 0.657 | -0.268 | 0.067 |
| 2.689203311472835 | 0.657 | -0.27 | 0.07 |
| 2.692344904126424 | 0.657 | -0.271 | 0.073 |
| 2.695486496780014 | 0.657 | -0.273 | 0.075 |
| 2.698628089433603 | 0.658 | -0.274 | 0.078 |
| 2.701769682087193 | 0.658 | -0.276 | 0.081 |
| 2.704911274740782 | 0.658 | -0.277 | 0.084 |
| 2.708052867394372 | 0.658 | -0.278 | 0.087 |
| 2.711194460047962 | 0.659 | -0.28 | 0.09 |
| 2.714336052701551 | 0.659 | -0.281 | 0.092 |
| 2.717477645355141 | 0.659 | -0.282 | 0.095 |
| 2.720619238008731 | 0.659 | -0.284 | 0.098 |
| 2.72376083066232 | 0.659 | -0.285 | 0.101 |
| 2.72690242331591 | 0.66 | -0.286 | 0.103 |
| 2.730044015969499 | 0.66 | -0.288 | 0.106 |
| 2.733185608623089 | 0.66 | -0.289 | 0.109 |
| 2.736327201276678 | 0.66 | -0.29 | 0.111 |
| 2.739468793930268 | 0.66 | -0.291 | 0.114 |
| 2.742610386583858 | 0.661 | -0.292 | 0.116 |
| 2.745751979237447 | 0.661 | -0.294 | 0.119 |
| 2.748893571891036 | 0.661 | -0.295 | 0.121 |
| 2.752035164544627 | 0.661 | -0.296 | 0.124 |
| 2.755176757198216 | 0.661 | -0.297 | 0.126 |
| 2.758318349851806 | 0.662 | -0.298 | 0.129 |
| 2.761459942505395 | 0.662 | -0.299 | 0.131 |
| 2.764601535158985 | 0.662 | -0.3 | 0.133 |
| 2.767743127812574 | 0.662 | -0.301 | 0.136 |
| 2.770884720466164 | 0.662 | -0.302 | 0.138 |
| 2.774026313119754 | 0.662 | -0.303 | 0.14 |
| 2.777167905773343 | 0.662 | -0.304 | 0.142 |
| 2.780309498426932 | 0.663 | -0.305 | 0.145 |
| 2.783451091080522 | 0.663 | -0.306 | 0.147 |
| 2.786592683734112 | 0.663 | -0.306 | 0.149 |
| 2.789734276387701 | 0.663 | -0.307 | 0.151 |
| 2.792875869041291 | 0.663 | -0.308 | 0.153 |
| 2.796017461694881 | 0.663 | -0.309 | 0.155 |
| 2.79915905434847 | 0.663 | -0.31 | 0.157 |
| 2.80230064700206 | 0.663 | -0.311 | 0.159 |
| 2.80544223965565 | 0.664 | -0.311 | 0.161 |
| 2.808583832309239 | 0.664 | -0.312 | 0.163 |
| 2.811725424962829 | 0.664 | -0.313 | 0.165 |
| 2.814867017616419 | 0.664 | -0.314 | 0.166 |
| 2.818008610270008 | 0.664 | -0.314 | 0.168 |
| 2.821150202923598 | 0.664 | -0.315 | 0.17 |
| 2.824291795577187 | 0.664 | -0.316 | 0.172 |
| 2.827433388230777 | 0.664 | -0.316 | 0.173 |
| 2.830574980884366 | 0.664 | -0.317 | 0.175 |
| 2.833716573537956 | 0.664 | -0.318 | 0.177 |
| 2.836858166191546 | 0.665 | -0.318 | 0.178 |
| 2.839999758845135 | 0.665 | -0.319 | 0.18 |
| 2.843141351498725 | 0.665 | -0.319 | 0.181 |
| 2.846282944152314 | 0.665 | -0.32 | 0.183 |
| 2.849424536805904 | 0.665 | -0.32 | 0.184 |
| 2.852566129459494 | 0.665 | -0.321 | 0.186 |
| 2.855707722113083 | 0.665 | -0.321 | 0.187 |
| 2.858849314766673 | 0.665 | -0.322 | 0.188 |
| 2.861990907420262 | 0.665 | -0.322 | 0.19 |
| 2.865132500073852 | 0.665 | -0.323 | 0.191 |
| 2.868274092727442 | 0.665 | -0.323 | 0.192 |
| 2.871415685381031 | 0.665 | -0.324 | 0.193 |
| 2.874557278034621 | 0.665 | -0.324 | 0.195 |
| 2.87769887068821 | 0.665 | -0.324 | 0.196 |
| 2.8808404633418 | 0.666 | -0.325 | 0.197 |
| 2.88398205599539 | 0.666 | -0.325 | 0.198 |
| 2.88712364864898 | 0.666 | -0.326 | 0.199 |
| 2.890265241302569 | 0.666 | -0.326 | 0.2 |
| 2.893406833956158 | 0.666 | -0.326 | 0.201 |
| 2.896548426609748 | 0.666 | -0.327 | 0.202 |
| 2.899690019263338 | 0.666 | -0.327 | 0.203 |
| 2.902831611916927 | 0.666 | -0.327 | 0.204 |
| 2.905973204570517 | 0.666 | -0.328 | 0.205 |
| 2.909114797224106 | 0.666 | -0.328 | 0.205 |
| 2.912256389877696 | 0.666 | -0.328 | 0.206 |
| 2.915397982531286 | 0.666 | -0.328 | 0.207 |
| 2.918539575184875 | 0.666 | -0.329 | 0.208 |
| 2.921681167838465 | 0.666 | -0.329 | 0.209 |
| 2.924822760492054 | 0.666 | -0.329 | 0.209 |
| 2.927964353145644 | 0.666 | -0.329 | 0.21 |
| 2.931105945799234 | 0.666 | -0.33 | 0.211 |
| 2.934247538452823 | 0.666 | -0.33 | 0.211 |
| 2.937389131106413 | 0.666 | -0.33 | 0.212 |
| 2.940530723760002 | 0.666 | -0.33 | 0.212 |
| 2.943672316413592 | 0.666 | -0.33 | 0.213 |
| 2.946813909067182 | 0.666 | -0.331 | 0.214 |
| 2.949955501720771 | 0.666 | -0.331 | 0.214 |
| 2.953097094374361 | 0.666 | -0.331 | 0.215 |
| 2.95623868702795 | 0.666 | -0.331 | 0.215 |
| 2.95938027968154 | 0.666 | -0.331 | 0.215 |
| 2.96252187233513 | 0.666 | -0.331 | 0.216 |
| 2.965663464988719 | 0.666 | -0.331 | 0.216 |
| 2.968805057642309 | 0.666 | -0.332 | 0.217 |
| 2.971946650295898 | 0.666 | -0.332 | 0.217 |
| 2.975088242949488 | 0.666 | -0.332 | 0.217 |
| 2.978229835603078 | 0.666 | -0.332 | 0.218 |
| 2.981371428256667 | 0.667 | -0.332 | 0.218 |
| 2.984513020910257 | 0.667 | -0.332 | 0.218 |
| 2.987654613563846 | 0.667 | -0.332 | 0.219 |
| 2.990796206217436 | 0.667 | -0.332 | 0.219 |
| 2.993937798871025 | 0.667 | -0.332 | 0.219 |
| 2.997079391524615 | 0.667 | -0.332 | 0.219 |
| 3.000220984178205 | 0.667 | -0.333 | 0.22 |
| 3.003362576831794 | 0.667 | -0.333 | 0.22 |
| 3.006504169485384 | 0.667 | -0.333 | 0.22 |
| 3.009645762138974 | 0.667 | -0.333 | 0.22 |
| 3.012787354792563 | 0.667 | -0.333 | 0.22 |
| 3.015928947446153 | 0.667 | -0.333 | 0.221 |
| 3.019070540099742 | 0.667 | -0.333 | 0.221 |
| 3.022212132753332 | 0.667 | -0.333 | 0.221 |
| 3.025353725406922 | 0.667 | -0.333 | 0.221 |
| 3.028495318060511 | 0.667 | -0.333 | 0.221 |
| 3.031636910714101 | 0.667 | -0.333 | 0.221 |
| 3.03477850336769 | 0.667 | -0.333 | 0.221 |
| 3.03792009602128 | 0.667 | -0.333 | 0.221 |
| 3.04106168867487 | 0.667 | -0.333 | 0.222 |
| 3.04420328132846 | 0.667 | -0.333 | 0.222 |
| 3.047344873982049 | 0.667 | -0.333 | 0.222 |
| 3.050486466635638 | 0.667 | -0.333 | 0.222 |
| 3.053628059289228 | 0.667 | -0.333 | 0.222 |
| 3.056769651942818 | 0.667 | -0.333 | 0.222 |
| 3.059911244596407 | 0.667 | -0.333 | 0.222 |
| 3.063052837249997 | 0.667 | -0.333 | 0.222 |
| 3.066194429903586 | 0.667 | -0.333 | 0.222 |
| 3.069336022557176 | 0.667 | -0.333 | 0.222 |
| 3.072477615210766 | 0.667 | -0.333 | 0.222 |
| 3.075619207864355 | 0.667 | -0.333 | 0.222 |
| 3.078760800517945 | 0.667 | -0.333 | 0.222 |
| 3.081902393171534 | 0.667 | -0.333 | 0.222 |
| 3.085043985825124 | 0.667 | -0.333 | 0.222 |
| 3.088185578478713 | 0.667 | -0.333 | 0.222 |
| 3.091327171132303 | 0.667 | -0.333 | 0.222 |
| 3.094468763785893 | 0.667 | -0.333 | 0.222 |
| 3.097610356439482 | 0.667 | -0.333 | 0.222 |
| 3.100751949093072 | 0.667 | -0.333 | 0.222 |
| 3.103893541746661 | 0.667 | -0.333 | 0.222 |
| 3.107035134400251 | 0.667 | -0.333 | 0.222 |
| 3.110176727053841 | 0.667 | -0.333 | 0.222 |
| 3.11331831970743 | 0.667 | -0.333 | 0.222 |
| 3.11645991236102 | 0.667 | -0.333 | 0.222 |
| 3.11960150501461 | 0.667 | -0.333 | 0.222 |
| 3.122743097668199 | 0.667 | -0.333 | 0.222 |
| 3.125884690321789 | 0.667 | -0.333 | 0.222 |
| 3.129026282975378 | 0.667 | -0.333 | 0.222 |
| 3.132167875628968 | 0.667 | -0.333 | 0.222 |
| 3.135309468282557 | 0.667 | -0.333 | 0.222 |
| 3.138451060936147 | 0.667 | -0.333 | 0.222 |
| 3.141592653589737 | 0.667 | -0.333 | 0.222 |
| 3.144734246243326 | 0.667 | -0.333 | 0.222 |
| 3.147875838896916 | 0.667 | -0.333 | 0.222 |
| 3.151017431550505 | 0.667 | -0.333 | 0.222 |
| 3.154159024204095 | 0.667 | -0.333 | 0.222 |
| 3.157300616857685 | 0.667 | -0.333 | 0.222 |
| 3.160442209511274 | 0.667 | -0.333 | 0.222 |
| 3.163583802164864 | 0.667 | -0.333 | 0.222 |
| 3.166725394818453 | 0.667 | -0.333 | 0.222 |
| 3.169866987472043 | 0.667 | -0.333 | 0.222 |
| 3.173008580125633 | 0.667 | -0.333 | 0.222 |
| 3.176150172779222 | 0.667 | -0.333 | 0.222 |
| 3.179291765432812 | 0.667 | -0.333 | 0.222 |
| 3.182433358086401 | 0.667 | -0.333 | 0.222 |
| 3.185574950739991 | 0.667 | -0.333 | 0.222 |
| 3.188716543393581 | 0.667 | -0.333 | 0.222 |
| 3.19185813604717 | 0.667 | -0.333 | 0.222 |
| 3.19499972870076 | 0.667 | -0.333 | 0.222 |
| 3.198141321354349 | 0.667 | -0.333 | 0.222 |
| 3.20128291400794 | 0.667 | -0.333 | 0.222 |
| 3.204424506661528 | 0.667 | -0.333 | 0.222 |
| 3.207566099315118 | 0.667 | -0.333 | 0.222 |
| 3.210707691968708 | 0.667 | -0.333 | 0.222 |
| 3.213849284622297 | 0.667 | -0.333 | 0.222 |
| 3.216990877275887 | 0.667 | -0.333 | 0.222 |
| 3.220132469929476 | 0.667 | -0.333 | 0.222 |
| 3.223274062583066 | 0.667 | -0.333 | 0.222 |
| 3.226415655236656 | 0.667 | -0.333 | 0.222 |
| 3.229557247890245 | 0.667 | -0.333 | 0.222 |
| 3.232698840543835 | 0.667 | -0.333 | 0.222 |
| 3.235840433197425 | 0.667 | -0.333 | 0.222 |
| 3.238982025851014 | 0.667 | -0.333 | 0.222 |
| 3.242123618504604 | 0.667 | -0.333 | 0.222 |
| 3.245265211158193 | 0.667 | -0.333 | 0.221 |
| 3.248406803811783 | 0.667 | -0.333 | 0.221 |
| 3.251548396465373 | 0.667 | -0.333 | 0.221 |
| 3.254689989118962 | 0.667 | -0.333 | 0.221 |
| 3.257831581772551 | 0.667 | -0.333 | 0.221 |
| 3.260973174426141 | 0.667 | -0.333 | 0.221 |
| 3.26411476707973 | 0.667 | -0.333 | 0.221 |
| 3.267256359733321 | 0.667 | -0.333 | 0.221 |
| 3.27039795238691 | 0.667 | -0.333 | 0.22 |
| 3.2735395450405 | 0.667 | -0.333 | 0.22 |
| 3.276681137694089 | 0.667 | -0.333 | 0.22 |
| 3.279822730347679 | 0.667 | -0.333 | 0.22 |
| 3.282964323001269 | 0.667 | -0.333 | 0.22 |
| 3.286105915654858 | 0.667 | -0.332 | 0.219 |
| 3.289247508308448 | 0.667 | -0.332 | 0.219 |
| 3.292389100962037 | 0.667 | -0.332 | 0.219 |
| 3.295530693615627 | 0.667 | -0.332 | 0.219 |
| 3.298672286269217 | 0.667 | -0.332 | 0.218 |
| 3.301813878922806 | 0.667 | -0.332 | 0.218 |
| 3.304955471576396 | 0.666 | -0.332 | 0.218 |
| 3.308097064229985 | 0.666 | -0.332 | 0.217 |
| 3.311238656883575 | 0.666 | -0.332 | 0.217 |
| 3.314380249537165 | 0.666 | -0.332 | 0.217 |
| 3.317521842190754 | 0.666 | -0.331 | 0.216 |
| 3.320663434844344 | 0.666 | -0.331 | 0.216 |
| 3.323805027497933 | 0.666 | -0.331 | 0.215 |
| 3.326946620151523 | 0.666 | -0.331 | 0.215 |
| 3.330088212805113 | 0.666 | -0.331 | 0.215 |
| 3.333229805458702 | 0.666 | -0.331 | 0.214 |
| 3.336371398112292 | 0.666 | -0.331 | 0.214 |
| 3.339512990765881 | 0.666 | -0.33 | 0.213 |
| 3.342654583419471 | 0.666 | -0.33 | 0.212 |
| 3.345796176073061 | 0.666 | -0.33 | 0.212 |
| 3.34893776872665 | 0.666 | -0.33 | 0.211 |
| 3.35207936138024 | 0.666 | -0.33 | 0.211 |
| 3.355220954033829 | 0.666 | -0.329 | 0.21 |
| 3.358362546687419 | 0.666 | -0.329 | 0.209 |
| 3.361504139341009 | 0.666 | -0.329 | 0.209 |
| 3.364645731994598 | 0.666 | -0.329 | 0.208 |
| 3.367787324648188 | 0.666 | -0.328 | 0.207 |
| 3.370928917301777 | 0.666 | -0.328 | 0.206 |
| 3.374070509955367 | 0.666 | -0.328 | 0.205 |
| 3.377212102608956 | 0.666 | -0.328 | 0.205 |
| 3.380353695262546 | 0.666 | -0.327 | 0.204 |
| 3.383495287916136 | 0.666 | -0.327 | 0.203 |
| 3.386636880569725 | 0.666 | -0.327 | 0.202 |
| 3.389778473223315 | 0.666 | -0.326 | 0.201 |
| 3.392920065876904 | 0.666 | -0.326 | 0.2 |
| 3.396061658530494 | 0.666 | -0.326 | 0.199 |
| 3.399203251184084 | 0.666 | -0.325 | 0.198 |
| 3.402344843837673 | 0.666 | -0.325 | 0.197 |
| 3.405486436491263 | 0.665 | -0.324 | 0.196 |
| 3.408628029144852 | 0.665 | -0.324 | 0.195 |
| 3.411769621798442 | 0.665 | -0.324 | 0.193 |
| 3.414911214452032 | 0.665 | -0.323 | 0.192 |
| 3.418052807105621 | 0.665 | -0.323 | 0.191 |
| 3.421194399759211 | 0.665 | -0.322 | 0.19 |
| 3.4243359924128 | 0.665 | -0.322 | 0.188 |
| 3.42747758506639 | 0.665 | -0.321 | 0.187 |
| 3.43061917771998 | 0.665 | -0.321 | 0.186 |
| 3.433760770373569 | 0.665 | -0.32 | 0.184 |
| 3.436902363027159 | 0.665 | -0.32 | 0.183 |
| 3.440043955680748 | 0.665 | -0.319 | 0.181 |
| 3.443185548334338 | 0.665 | -0.319 | 0.18 |
| 3.446327140987927 | 0.665 | -0.318 | 0.178 |
| 3.449468733641517 | 0.664 | -0.318 | 0.177 |
| 3.452610326295107 | 0.664 | -0.317 | 0.175 |
| 3.455751918948696 | 0.664 | -0.316 | 0.173 |
| 3.458893511602286 | 0.664 | -0.316 | 0.172 |
| 3.462035104255876 | 0.664 | -0.315 | 0.17 |
| 3.465176696909465 | 0.664 | -0.314 | 0.168 |
| 3.468318289563055 | 0.664 | -0.314 | 0.166 |
| 3.471459882216644 | 0.664 | -0.313 | 0.165 |
| 3.474601474870234 | 0.664 | -0.312 | 0.163 |
| 3.477743067523824 | 0.664 | -0.311 | 0.161 |
| 3.480884660177413 | 0.663 | -0.311 | 0.159 |
| 3.484026252831002 | 0.663 | -0.31 | 0.157 |
| 3.487167845484592 | 0.663 | -0.309 | 0.155 |
| 3.490309438138182 | 0.663 | -0.308 | 0.153 |
| 3.493451030791772 | 0.663 | -0.307 | 0.151 |
| 3.496592623445361 | 0.663 | -0.306 | 0.149 |
| 3.499734216098951 | 0.663 | -0.306 | 0.147 |
| 3.50287580875254 | 0.663 | -0.305 | 0.145 |
| 3.50601740140613 | 0.662 | -0.304 | 0.142 |
| 3.50915899405972 | 0.662 | -0.303 | 0.14 |
| 3.512300586713309 | 0.662 | -0.302 | 0.138 |
| 3.515442179366899 | 0.662 | -0.301 | 0.136 |
| 3.518583772020488 | 0.662 | -0.3 | 0.133 |
| 3.521725364674078 | 0.662 | -0.299 | 0.131 |
| 3.524866957327668 | 0.662 | -0.298 | 0.129 |
| 3.528008549981257 | 0.661 | -0.297 | 0.126 |
| 3.531150142634847 | 0.661 | -0.296 | 0.124 |
| 3.534291735288436 | 0.661 | -0.295 | 0.121 |
| 3.537433327942026 | 0.661 | -0.294 | 0.119 |
| 3.540574920595616 | 0.661 | -0.292 | 0.116 |
| 3.543716513249205 | 0.66 | -0.291 | 0.114 |
| 3.546858105902795 | 0.66 | -0.29 | 0.111 |
| 3.549999698556384 | 0.66 | -0.289 | 0.109 |
| 3.553141291209974 | 0.66 | -0.288 | 0.106 |
| 3.556282883863564 | 0.66 | -0.286 | 0.103 |
| 3.559424476517153 | 0.659 | -0.285 | 0.101 |
| 3.562566069170743 | 0.659 | -0.284 | 0.098 |
| 3.565707661824332 | 0.659 | -0.282 | 0.095 |
| 3.568849254477922 | 0.659 | -0.281 | 0.092 |
| 3.571990847131511 | 0.659 | -0.28 | 0.09 |
| 3.575132439785101 | 0.658 | -0.278 | 0.087 |
| 3.578274032438691 | 0.658 | -0.277 | 0.084 |
| 3.58141562509228 | 0.658 | -0.276 | 0.081 |
| 3.58455721774587 | 0.658 | -0.274 | 0.078 |
| 3.58769881039946 | 0.657 | -0.273 | 0.075 |
| 3.590840403053049 | 0.657 | -0.271 | 0.073 |
| 3.593981995706639 | 0.657 | -0.27 | 0.07 |
| 3.597123588360228 | 0.657 | -0.268 | 0.067 |
| 3.600265181013818 | 0.656 | -0.267 | 0.064 |
| 3.603406773667407 | 0.656 | -0.265 | 0.061 |
| 3.606548366320997 | 0.656 | -0.263 | 0.058 |
| 3.609689958974587 | 0.656 | -0.262 | 0.055 |
| 3.612831551628176 | 0.655 | -0.26 | 0.052 |
| 3.615973144281766 | 0.655 | -0.258 | 0.049 |
| 3.619114736935355 | 0.655 | -0.257 | 0.046 |
| 3.622256329588945 | 0.654 | -0.255 | 0.043 |
| 3.625397922242534 | 0.654 | -0.253 | 0.04 |
| 3.628539514896124 | 0.654 | -0.251 | 0.036 |
| 3.631681107549714 | 0.653 | -0.25 | 0.033 |
| 3.634822700203303 | 0.653 | -0.248 | 0.03 |
| 3.637964292856893 | 0.653 | -0.246 | 0.027 |
| 3.641105885510483 | 0.652 | -0.244 | 0.024 |
| 3.644247478164072 | 0.652 | -0.242 | 0.021 |
| 3.647389070817662 | 0.652 | -0.24 | 0.018 |
| 3.650530663471251 | 0.651 | -0.238 | 0.015 |
| 3.653672256124841 | 0.651 | -0.236 | 0.012 |
| 3.656813848778431 | 0.651 | -0.235 | 0.008 |
| 3.65995544143202 | 0.65 | -0.233 | 0.005 |
| 3.66309703408561 | 0.65 | -0.231 | 0.002 |
| 3.666238626739199 | 0.649 | -0.228 | -0.001 |
| 3.66938021939279 | 0.649 | -0.226 | -0.004 |
| 3.672521812046378 | 0.649 | -0.224 | -0.007 |
| 3.675663404699968 | 0.648 | -0.222 | -0.01 |
| 3.678804997353558 | 0.648 | -0.22 | -0.014 |
| 3.681946590007147 | 0.647 | -0.218 | -0.017 |
| 3.685088182660737 | 0.647 | -0.216 | -0.02 |
| 3.688229775314326 | 0.646 | -0.214 | -0.023 |
| 3.691371367967916 | 0.646 | -0.211 | -0.026 |
| 3.694512960621506 | 0.646 | -0.209 | -0.029 |
| 3.697654553275095 | 0.645 | -0.207 | -0.032 |
| 3.700796145928685 | 0.645 | -0.205 | -0.035 |
| 3.703937738582274 | 0.644 | -0.202 | -0.038 |
| 3.707079331235864 | 0.644 | -0.2 | -0.042 |
| 3.710220923889454 | 0.643 | -0.198 | -0.045 |
| 3.713362516543043 | 0.643 | -0.195 | -0.048 |
| 3.716504109196633 | 0.642 | -0.193 | -0.051 |
| 3.719645701850223 | 0.642 | -0.191 | -0.054 |
| 3.722787294503812 | 0.641 | -0.188 | -0.057 |
| 3.725928887157402 | 0.641 | -0.186 | -0.06 |
| 3.729070479810991 | 0.64 | -0.183 | -0.063 |
| 3.732212072464581 | 0.64 | -0.181 | -0.066 |
| 3.735353665118171 | 0.639 | -0.178 | -0.069 |
| 3.73849525777176 | 0.638 | -0.176 | -0.072 |
| 3.74163685042535 | 0.638 | -0.173 | -0.074 |
| 3.744778443078939 | 0.637 | -0.171 | -0.077 |
| 3.747920035732529 | 0.637 | -0.168 | -0.08 |
| 3.751061628386119 | 0.636 | -0.165 | -0.083 |
| 3.754203221039708 | 0.636 | -0.163 | -0.086 |
| 3.757344813693298 | 0.635 | -0.16 | -0.089 |
| 3.760486406346887 | 0.634 | -0.158 | -0.092 |
| 3.763627999000477 | 0.634 | -0.155 | -0.094 |
| 3.766769591654067 | 0.633 | -0.152 | -0.097 |
| 3.769911184307656 | 0.633 | -0.15 | -0.1 |
| 3.773052776961246 | 0.632 | -0.147 | -0.102 |
| 3.776194369614835 | 0.631 | -0.144 | -0.105 |
| 3.779335962268425 | 0.631 | -0.141 | -0.108 |
| 3.782477554922014 | 0.63 | -0.139 | -0.11 |
| 3.785619147575604 | 0.629 | -0.136 | -0.113 |
| 3.788760740229193 | 0.629 | -0.133 | -0.115 |
| 3.791902332882783 | 0.628 | -0.13 | -0.118 |
| 3.795043925536373 | 0.627 | -0.127 | -0.121 |
| 3.798185518189962 | 0.626 | -0.125 | -0.123 |
| 3.801327110843552 | 0.626 | -0.122 | -0.125 |
| 3.804468703497142 | 0.625 | -0.119 | -0.128 |
| 3.807610296150731 | 0.624 | -0.116 | -0.13 |
| 3.810751888804321 | 0.624 | -0.113 | -0.133 |
| 3.813893481457911 | 0.623 | -0.11 | -0.135 |
| 3.8170350741115 | 0.622 | -0.107 | -0.137 |
| 3.82017666676509 | 0.621 | -0.104 | -0.139 |
| 3.823318259418679 | 0.62 | -0.101 | -0.142 |
| 3.826459852072269 | 0.62 | -0.099 | -0.144 |
| 3.829601444725859 | 0.619 | -0.096 | -0.146 |
| 3.832743037379448 | 0.618 | -0.093 | -0.148 |
| 3.835884630033038 | 0.617 | -0.09 | -0.15 |
| 3.839026222686627 | 0.616 | -0.087 | -0.152 |
| 3.842167815340217 | 0.616 | -0.084 | -0.154 |
| 3.845309407993807 | 0.615 | -0.081 | -0.156 |
| 3.848451000647396 | 0.614 | -0.078 | -0.158 |
| 3.851592593300986 | 0.613 | -0.075 | -0.16 |
| 3.854734185954575 | 0.612 | -0.072 | -0.162 |
| 3.857875778608165 | 0.611 | -0.068 | -0.164 |
| 3.861017371261755 | 0.61 | -0.065 | -0.166 |
| 3.864158963915344 | 0.609 | -0.062 | -0.168 |
| 3.867300556568933 | 0.609 | -0.059 | -0.169 |
| 3.870442149222523 | 0.608 | -0.056 | -0.171 |
| 3.873583741876112 | 0.607 | -0.053 | -0.173 |
| 3.876725334529703 | 0.606 | -0.05 | -0.174 |
| 3.879866927183292 | 0.605 | -0.047 | -0.176 |
| 3.883008519836882 | 0.604 | -0.044 | -0.178 |
| 3.886150112490471 | 0.603 | -0.041 | -0.179 |
| 3.889291705144061 | 0.602 | -0.038 | -0.181 |
| 3.892433297797651 | 0.601 | -0.034 | -0.182 |
| 3.89557489045124 | 0.6 | -0.031 | -0.184 |
| 3.89871648310483 | 0.599 | -0.028 | -0.185 |
| 3.901858075758419 | 0.598 | -0.025 | -0.187 |
| 3.904999668412009 | 0.597 | -0.022 | -0.188 |
| 3.908141261065598 | 0.596 | -0.019 | -0.189 |
| 3.911282853719188 | 0.595 | -0.016 | -0.19 |
| 3.914424446372778 | 0.594 | -0.013 | -0.192 |
| 3.917566039026367 | 0.593 | -0.009 | -0.193 |
| 3.920707631679957 | 0.591 | -0.006 | -0.194 |
| 3.923849224333547 | 0.59 | -0.003 | -0.195 |
| 3.926990816987136 | 0.589 | 0 | -0.196 |
| 3.930132409640726 | 0.588 | 0.003 | -0.198 |
| 3.933274002294315 | 0.587 | 0.006 | -0.199 |
| 3.936415594947905 | 0.586 | 0.009 | -0.2 |
| 3.939557187601495 | 0.585 | 0.013 | -0.201 |
| 3.942698780255084 | 0.584 | 0.016 | -0.202 |
| 3.945840372908674 | 0.582 | 0.019 | -0.203 |
| 3.948981965562263 | 0.581 | 0.022 | -0.203 |
| 3.952123558215853 | 0.58 | 0.025 | -0.204 |
| 3.955265150869442 | 0.579 | 0.028 | -0.205 |
| 3.958406743523032 | 0.578 | 0.031 | -0.206 |
| 3.961548336176622 | 0.576 | 0.034 | -0.207 |
| 3.964689928830211 | 0.575 | 0.038 | -0.208 |
| 3.967831521483801 | 0.574 | 0.041 | -0.208 |
| 3.97097311413739 | 0.573 | 0.044 | -0.209 |
| 3.97411470679098 | 0.571 | 0.047 | -0.21 |
| 3.97725629944457 | 0.57 | 0.05 | -0.21 |
| 3.98039789209816 | 0.569 | 0.053 | -0.211 |
| 3.983539484751749 | 0.568 | 0.056 | -0.212 |
| 3.986681077405338 | 0.566 | 0.059 | -0.212 |
| 3.989822670058928 | 0.565 | 0.062 | -0.213 |
| 3.992964262712517 | 0.564 | 0.065 | -0.213 |
| 3.996105855366107 | 0.562 | 0.068 | -0.214 |
| 3.999247448019697 | 0.561 | 0.072 | -0.214 |
| 4.002389040673287 | 0.56 | 0.075 | -0.215 |
| 4.005530633326877 | 0.558 | 0.078 | -0.215 |
| 4.008672225980466 | 0.557 | 0.081 | -0.216 |
| 4.011813818634056 | 0.555 | 0.084 | -0.216 |
| 4.014955411287645 | 0.554 | 0.087 | -0.217 |
| 4.018097003941234 | 0.553 | 0.09 | -0.217 |
| 4.021238596594824 | 0.551 | 0.093 | -0.217 |
| 4.024380189248414 | 0.55 | 0.096 | -0.218 |
| 4.027521781902004 | 0.548 | 0.099 | -0.218 |
| 4.030663374555593 | 0.547 | 0.101 | -0.218 |
| 4.033804967209183 | 0.545 | 0.104 | -0.219 |
| 4.036946559862773 | 0.544 | 0.107 | -0.219 |
| 4.040088152516362 | 0.542 | 0.11 | -0.219 |
| 4.043229745169951 | 0.541 | 0.113 | -0.219 |
| 4.046371337823541 | 0.539 | 0.116 | -0.22 |
| 4.049512930477131 | 0.538 | 0.119 | -0.22 |
| 4.05265452313072 | 0.536 | 0.122 | -0.22 |
| 4.05579611578431 | 0.535 | 0.125 | -0.22 |
| 4.0589377084379 | 0.533 | 0.127 | -0.22 |
| 4.062079301091489 | 0.531 | 0.13 | -0.221 |
| 4.065220893745079 | 0.53 | 0.133 | -0.221 |
| 4.068362486398668 | 0.528 | 0.136 | -0.221 |
| 4.071504079052258 | 0.527 | 0.139 | -0.221 |
| 4.074645671705848 | 0.525 | 0.141 | -0.221 |
| 4.077787264359437 | 0.523 | 0.144 | -0.221 |
| 4.080928857013027 | 0.522 | 0.147 | -0.221 |
| 4.084070449666616 | 0.52 | 0.15 | -0.221 |
| 4.087212042320206 | 0.518 | 0.152 | -0.222 |
| 4.090353634973795 | 0.517 | 0.155 | -0.222 |
| 4.093495227627385 | 0.515 | 0.158 | -0.222 |
| 4.096636820280975 | 0.513 | 0.16 | -0.222 |
| 4.099778412934564 | 0.512 | 0.163 | -0.222 |
| 4.102920005588154 | 0.51 | 0.165 | -0.222 |
| 4.106061598241744 | 0.508 | 0.168 | -0.222 |
| 4.109203190895333 | 0.506 | 0.171 | -0.222 |
| 4.112344783548923 | 0.505 | 0.173 | -0.222 |
| 4.115486376202512 | 0.503 | 0.176 | -0.222 |
| 4.118627968856102 | 0.501 | 0.178 | -0.222 |
| 4.121769561509692 | 0.499 | 0.181 | -0.222 |
| 4.124911154163281 | 0.498 | 0.183 | -0.222 |
| 4.128052746816871 | 0.496 | 0.186 | -0.222 |
| 4.13119433947046 | 0.494 | 0.188 | -0.222 |
| 4.13433593212405 | 0.492 | 0.191 | -0.222 |
| 4.13747752477764 | 0.49 | 0.193 | -0.222 |
| 4.14061911743123 | 0.488 | 0.195 | -0.222 |
| 4.143760710084818 | 0.486 | 0.198 | -0.222 |
| 4.146902302738408 | 0.485 | 0.2 | -0.222 |
| 4.150043895391998 | 0.483 | 0.202 | -0.222 |
| 4.153185488045588 | 0.481 | 0.205 | -0.222 |
| 4.156327080699177 | 0.479 | 0.207 | -0.222 |
| 4.159468673352766 | 0.477 | 0.209 | -0.222 |
| 4.162610266006356 | 0.475 | 0.211 | -0.222 |
| 4.165751858659946 | 0.473 | 0.214 | -0.222 |
| 4.168893451313535 | 0.471 | 0.216 | -0.222 |
| 4.172035043967125 | 0.469 | 0.218 | -0.222 |
| 4.175176636620715 | 0.467 | 0.22 | -0.222 |
| 4.178318229274304 | 0.465 | 0.222 | -0.222 |
| 4.181459821927894 | 0.463 | 0.224 | -0.222 |
| 4.184601414581484 | 0.461 | 0.226 | -0.222 |
| 4.187743007235073 | 0.459 | 0.228 | -0.222 |
| 4.190884599888663 | 0.457 | 0.231 | -0.222 |
| 4.194026192542252 | 0.455 | 0.233 | -0.222 |
| 4.197167785195842 | 0.453 | 0.235 | -0.222 |
| 4.200309377849432 | 0.451 | 0.236 | -0.222 |
| 4.203450970503021 | 0.449 | 0.238 | -0.222 |
| 4.206592563156611 | 0.447 | 0.24 | -0.222 |
| 4.2097341558102 | 0.444 | 0.242 | -0.222 |
| 4.21287574846379 | 0.442 | 0.244 | -0.222 |
| 4.21601734111738 | 0.44 | 0.246 | -0.222 |
| 4.21915893377097 | 0.438 | 0.248 | -0.222 |
| 4.222300526424559 | 0.436 | 0.25 | -0.222 |
| 4.225442119078148 | 0.434 | 0.251 | -0.222 |
| 4.228583711731738 | 0.432 | 0.253 | -0.222 |
| 4.231725304385327 | 0.429 | 0.255 | -0.222 |
| 4.234866897038917 | 0.427 | 0.257 | -0.222 |
| 4.238008489692506 | 0.425 | 0.258 | -0.222 |
| 4.241150082346096 | 0.423 | 0.26 | -0.222 |
| 4.244291674999685 | 0.421 | 0.262 | -0.222 |
| 4.247433267653276 | 0.418 | 0.263 | -0.222 |
| 4.250574860306865 | 0.416 | 0.265 | -0.222 |
| 4.253716452960455 | 0.414 | 0.267 | -0.222 |
| 4.256858045614044 | 0.412 | 0.268 | -0.222 |
| 4.259999638267634 | 0.409 | 0.27 | -0.222 |
| 4.263141230921224 | 0.407 | 0.271 | -0.222 |
| 4.266282823574813 | 0.405 | 0.273 | -0.222 |
| 4.269424416228403 | 0.402 | 0.274 | -0.222 |
| 4.272566008881992 | 0.4 | 0.276 | -0.222 |
| 4.275707601535582 | 0.398 | 0.277 | -0.222 |
| 4.27884919418917 | 0.395 | 0.278 | -0.222 |
| 4.28199078684276 | 0.393 | 0.28 | -0.222 |
| 4.285132379496351 | 0.391 | 0.281 | -0.222 |
| 4.28827397214994 | 0.388 | 0.282 | -0.222 |
| 4.29141556480353 | 0.386 | 0.284 | -0.221 |
| 4.294557157457119 | 0.384 | 0.285 | -0.221 |
| 4.29769875011071 | 0.381 | 0.286 | -0.221 |
| 4.300840342764299 | 0.379 | 0.288 | -0.221 |
| 4.303981935417888 | 0.376 | 0.289 | -0.221 |
| 4.307123528071478 | 0.374 | 0.29 | -0.221 |
| 4.310265120725067 | 0.371 | 0.291 | -0.221 |
| 4.313406713378657 | 0.369 | 0.292 | -0.221 |
| 4.316548306032247 | 0.366 | 0.294 | -0.221 |
| 4.319689898685836 | 0.364 | 0.295 | -0.22 |
| 4.322831491339426 | 0.362 | 0.296 | -0.22 |
| 4.325973083993015 | 0.359 | 0.297 | -0.22 |
| 4.329114676646605 | 0.357 | 0.298 | -0.22 |
| 4.332256269300195 | 0.354 | 0.299 | -0.22 |
| 4.335397861953784 | 0.351 | 0.3 | -0.219 |
| 4.338539454607374 | 0.349 | 0.301 | -0.219 |
| 4.341681047260963 | 0.346 | 0.302 | -0.219 |
| 4.344822639914553 | 0.344 | 0.303 | -0.219 |
| 4.347964232568143 | 0.341 | 0.304 | -0.218 |
| 4.351105825221732 | 0.339 | 0.305 | -0.218 |
| 4.354247417875322 | 0.336 | 0.306 | -0.218 |
| 4.357389010528911 | 0.334 | 0.306 | -0.217 |
| 4.360530603182501 | 0.331 | 0.307 | -0.217 |
| 4.36367219583609 | 0.328 | 0.308 | -0.216 |
| 4.36681378848968 | 0.326 | 0.309 | -0.216 |
| 4.36995538114327 | 0.323 | 0.31 | -0.216 |
| 4.373096973796859 | 0.321 | 0.311 | -0.215 |
| 4.376238566450449 | 0.318 | 0.311 | -0.215 |
| 4.379380159104038 | 0.315 | 0.312 | -0.214 |
| 4.382521751757628 | 0.313 | 0.313 | -0.214 |
| 4.385663344411217 | 0.31 | 0.314 | -0.213 |
| 4.388804937064807 | 0.307 | 0.314 | -0.213 |
| 4.391946529718397 | 0.305 | 0.315 | -0.212 |
| 4.395088122371987 | 0.302 | 0.316 | -0.211 |
| 4.398229715025576 | 0.299 | 0.316 | -0.211 |
| 4.401371307679165 | 0.296 | 0.317 | -0.21 |
| 4.404512900332755 | 0.294 | 0.318 | -0.21 |
| 4.407654492986345 | 0.291 | 0.318 | -0.209 |
| 4.410796085639934 | 0.288 | 0.319 | -0.208 |
| 4.413937678293524 | 0.286 | 0.319 | -0.207 |
| 4.417079270947114 | 0.283 | 0.32 | -0.207 |
| 4.420220863600703 | 0.28 | 0.32 | -0.206 |
| 4.423362456254293 | 0.277 | 0.321 | -0.205 |
| 4.426504048907883 | 0.275 | 0.321 | -0.204 |
| 4.429645641561472 | 0.272 | 0.322 | -0.203 |
| 4.432787234215062 | 0.269 | 0.322 | -0.202 |
| 4.435928826868651 | 0.266 | 0.323 | -0.201 |
| 4.43907041952224 | 0.263 | 0.323 | -0.2 |
| 4.44221201217583 | 0.261 | 0.324 | -0.199 |
| 4.44535360482942 | 0.258 | 0.324 | -0.198 |
| 4.44849519748301 | 0.255 | 0.324 | -0.197 |
| 4.4516367901366 | 0.252 | 0.325 | -0.196 |
| 4.454778382790188 | 0.249 | 0.325 | -0.195 |
| 4.457919975443779 | 0.246 | 0.326 | -0.194 |
| 4.461061568097368 | 0.244 | 0.326 | -0.193 |
| 4.464203160750958 | 0.241 | 0.326 | -0.191 |
| 4.467344753404547 | 0.238 | 0.327 | -0.19 |
| 4.470486346058137 | 0.235 | 0.327 | -0.189 |
| 4.473627938711726 | 0.232 | 0.327 | -0.187 |
| 4.476769531365316 | 0.229 | 0.328 | -0.186 |
| 4.479911124018905 | 0.226 | 0.328 | -0.185 |
| 4.483052716672495 | 0.223 | 0.328 | -0.183 |
| 4.486194309326085 | 0.221 | 0.328 | -0.182 |
| 4.489335901979674 | 0.218 | 0.329 | -0.18 |
| 4.492477494633264 | 0.215 | 0.329 | -0.179 |
| 4.495619087286854 | 0.212 | 0.329 | -0.177 |
| 4.498760679940443 | 0.209 | 0.329 | -0.176 |
| 4.501902272594033 | 0.206 | 0.33 | -0.174 |
| 4.505043865247622 | 0.203 | 0.33 | -0.172 |
| 4.508185457901212 | 0.2 | 0.33 | -0.171 |
| 4.511327050554801 | 0.197 | 0.33 | -0.169 |
| 4.514468643208391 | 0.194 | 0.33 | -0.167 |
| 4.517610235861981 | 0.191 | 0.331 | -0.165 |
| 4.520751828515571 | 0.188 | 0.331 | -0.163 |
| 4.52389342116916 | 0.185 | 0.331 | -0.162 |
| 4.52703501382275 | 0.182 | 0.331 | -0.16 |
| 4.530176606476339 | 0.179 | 0.331 | -0.158 |
| 4.533318199129928 | 0.176 | 0.331 | -0.156 |
| 4.536459791783518 | 0.173 | 0.331 | -0.154 |
| 4.539601384437108 | 0.17 | 0.332 | -0.152 |
| 4.542742977090698 | 0.167 | 0.332 | -0.15 |
| 4.545884569744287 | 0.164 | 0.332 | -0.147 |
| 4.549026162397876 | 0.161 | 0.332 | -0.145 |
| 4.552167755051466 | 0.158 | 0.332 | -0.143 |
| 4.555309347705056 | 0.155 | 0.332 | -0.141 |
| 4.558450940358646 | 0.152 | 0.332 | -0.139 |
| 4.561592533012235 | 0.149 | 0.332 | -0.136 |
| 4.564734125665825 | 0.146 | 0.332 | -0.134 |
| 4.567875718319415 | 0.143 | 0.332 | -0.132 |
| 4.571017310973004 | 0.14 | 0.333 | -0.129 |
| 4.574158903626594 | 0.137 | 0.333 | -0.127 |
| 4.577300496280183 | 0.134 | 0.333 | -0.125 |
| 4.580442088933772 | 0.131 | 0.333 | -0.122 |
| 4.583583681587362 | 0.128 | 0.333 | -0.12 |
| 4.586725274240952 | 0.125 | 0.333 | -0.117 |
| 4.589866866894542 | 0.122 | 0.333 | -0.115 |
| 4.593008459548131 | 0.119 | 0.333 | -0.112 |
| 4.596150052201721 | 0.115 | 0.333 | -0.109 |
| 4.59929164485531 | 0.112 | 0.333 | -0.107 |
| 4.6024332375089 | 0.109 | 0.333 | -0.104 |
| 4.60557483016249 | 0.106 | 0.333 | -0.102 |
| 4.608716422816079 | 0.103 | 0.333 | -0.099 |
| 4.611858015469668 | 0.1 | 0.333 | -0.096 |
| 4.614999608123258 | 0.097 | 0.333 | -0.093 |
| 4.618141200776848 | 0.094 | 0.333 | -0.091 |
| 4.621282793430437 | 0.091 | 0.333 | -0.088 |
| 4.624424386084027 | 0.088 | 0.333 | -0.085 |
| 4.627565978737617 | 0.085 | 0.333 | -0.082 |
| 4.630707571391206 | 0.081 | 0.333 | -0.079 |
| 4.633849164044795 | 0.078 | 0.333 | -0.076 |
| 4.636990756698386 | 0.075 | 0.333 | -0.074 |
| 4.640132349351975 | 0.072 | 0.333 | -0.071 |
| 4.643273942005564 | 0.069 | 0.333 | -0.068 |
| 4.646415534659154 | 0.066 | 0.333 | -0.065 |
| 4.649557127312744 | 0.063 | 0.333 | -0.062 |
| 4.652698719966334 | 0.06 | 0.333 | -0.059 |
| 4.655840312619923 | 0.056 | 0.333 | -0.056 |
| 4.658981905273513 | 0.053 | 0.333 | -0.053 |
| 4.662123497927102 | 0.05 | 0.333 | -0.05 |
| 4.665265090580692 | 0.047 | 0.333 | -0.047 |
| 4.668406683234282 | 0.044 | 0.333 | -0.044 |
| 4.671548275887871 | 0.041 | 0.333 | -0.041 |
| 4.674689868541461 | 0.038 | 0.333 | -0.037 |
| 4.67783146119505 | 0.035 | 0.333 | -0.034 |
| 4.68097305384864 | 0.031 | 0.333 | -0.031 |
| 4.68411464650223 | 0.028 | 0.333 | -0.028 |
| 4.687256239155819 | 0.025 | 0.333 | -0.025 |
| 4.690397831809409 | 0.022 | 0.333 | -0.022 |
| 4.693539424462998 | 0.019 | 0.333 | -0.019 |
| 4.696681017116588 | 0.016 | 0.333 | -0.016 |
| 4.699822609770177 | 0.013 | 0.333 | -0.013 |
| 4.702964202423767 | 0.009 | 0.333 | -0.009 |
| 4.706105795077356 | 0.006 | 0.333 | -0.006 |
| 4.709247387730946 | 0.003 | 0.333 | -0.003 |
| 4.712388980384535 | 0 | 0.333 | 0 |
| 4.715530573038126 | -0.003 | 0.333 | 0.003 |
| 4.718672165691715 | -0.006 | 0.333 | 0.006 |
| 4.721813758345305 | -0.009 | 0.333 | 0.009 |
| 4.724955350998894 | -0.013 | 0.333 | 0.013 |
| 4.728096943652484 | -0.016 | 0.333 | 0.016 |
| 4.731238536306074 | -0.019 | 0.333 | 0.019 |
| 4.734380128959663 | -0.022 | 0.333 | 0.022 |
| 4.737521721613253 | -0.025 | 0.333 | 0.025 |
| 4.740663314266842 | -0.028 | 0.333 | 0.028 |
| 4.743804906920432 | -0.031 | 0.333 | 0.031 |
| 4.74694649957402 | -0.035 | 0.333 | 0.034 |
| 4.750088092227611 | -0.038 | 0.333 | 0.037 |
| 4.7532296848812 | -0.041 | 0.333 | 0.041 |
| 4.75637127753479 | -0.044 | 0.333 | 0.044 |
| 4.75951287018838 | -0.047 | 0.333 | 0.047 |
| 4.76265446284197 | -0.05 | 0.333 | 0.05 |
| 4.765796055495559 | -0.053 | 0.333 | 0.053 |
| 4.768937648149149 | -0.056 | 0.333 | 0.056 |
| 4.772079240802738 | -0.06 | 0.333 | 0.059 |
| 4.775220833456327 | -0.063 | 0.333 | 0.062 |
| 4.778362426109917 | -0.066 | 0.333 | 0.065 |
| 4.781504018763507 | -0.069 | 0.333 | 0.068 |
| 4.784645611417097 | -0.072 | 0.333 | 0.071 |
| 4.787787204070686 | -0.075 | 0.333 | 0.074 |
| 4.790928796724275 | -0.078 | 0.333 | 0.076 |
| 4.794070389377865 | -0.081 | 0.333 | 0.079 |
| 4.797211982031455 | -0.085 | 0.333 | 0.082 |
| 4.800353574685045 | -0.088 | 0.333 | 0.085 |
| 4.803495167338634 | -0.091 | 0.333 | 0.088 |
| 4.806636759992224 | -0.094 | 0.333 | 0.091 |
| 4.809778352645814 | -0.097 | 0.333 | 0.093 |
| 4.812919945299403 | -0.1 | 0.333 | 0.096 |
| 4.816061537952993 | -0.103 | 0.333 | 0.099 |
| 4.819203130606582 | -0.106 | 0.333 | 0.102 |
| 4.822344723260172 | -0.109 | 0.333 | 0.104 |
| 4.825486315913761 | -0.112 | 0.333 | 0.107 |
| 4.828627908567351 | -0.115 | 0.333 | 0.109 |
| 4.83176950122094 | -0.119 | 0.333 | 0.112 |
| 4.83491109387453 | -0.122 | 0.333 | 0.115 |
| 4.83805268652812 | -0.125 | 0.333 | 0.117 |
| 4.841194279181709 | -0.128 | 0.333 | 0.12 |
| 4.844335871835299 | -0.131 | 0.333 | 0.122 |
| 4.847477464488889 | -0.134 | 0.333 | 0.125 |
| 4.850619057142478 | -0.137 | 0.333 | 0.127 |
| 4.853760649796068 | -0.14 | 0.333 | 0.129 |
| 4.856902242449657 | -0.143 | 0.332 | 0.132 |
| 4.860043835103247 | -0.146 | 0.332 | 0.134 |
| 4.863185427756837 | -0.149 | 0.332 | 0.136 |
| 4.866327020410426 | -0.152 | 0.332 | 0.139 |
| 4.869468613064015 | -0.155 | 0.332 | 0.141 |
| 4.872610205717605 | -0.158 | 0.332 | 0.143 |
| 4.875751798371195 | -0.161 | 0.332 | 0.145 |
| 4.878893391024784 | -0.164 | 0.332 | 0.147 |
| 4.882034983678374 | -0.167 | 0.332 | 0.15 |
| 4.885176576331964 | -0.17 | 0.332 | 0.152 |
| 4.888318168985553 | -0.173 | 0.331 | 0.154 |
| 4.891459761639143 | -0.176 | 0.331 | 0.156 |
| 4.894601354292733 | -0.179 | 0.331 | 0.158 |
| 4.897742946946322 | -0.182 | 0.331 | 0.16 |
| 4.900884539599912 | -0.185 | 0.331 | 0.162 |
| 4.904026132253501 | -0.188 | 0.331 | 0.163 |
| 4.907167724907091 | -0.191 | 0.331 | 0.165 |
| 4.91030931756068 | -0.194 | 0.33 | 0.167 |
| 4.91345091021427 | -0.197 | 0.33 | 0.169 |
| 4.91659250286786 | -0.2 | 0.33 | 0.171 |
| 4.91973409552145 | -0.203 | 0.33 | 0.172 |
| 4.922875688175039 | -0.206 | 0.33 | 0.174 |
| 4.926017280828628 | -0.209 | 0.329 | 0.176 |
| 4.929158873482218 | -0.212 | 0.329 | 0.177 |
| 4.932300466135808 | -0.215 | 0.329 | 0.179 |
| 4.935442058789397 | -0.218 | 0.329 | 0.18 |
| 4.938583651442987 | -0.221 | 0.328 | 0.182 |
| 4.941725244096576 | -0.223 | 0.328 | 0.183 |
| 4.944866836750166 | -0.226 | 0.328 | 0.185 |
| 4.948008429403755 | -0.229 | 0.328 | 0.186 |
| 4.951150022057345 | -0.232 | 0.327 | 0.187 |
| 4.954291614710935 | -0.235 | 0.327 | 0.189 |
| 4.957433207364524 | -0.238 | 0.327 | 0.19 |
| 4.960574800018114 | -0.241 | 0.326 | 0.191 |
| 4.963716392671704 | -0.244 | 0.326 | 0.193 |
| 4.966857985325293 | -0.246 | 0.326 | 0.194 |
| 4.969999577978883 | -0.249 | 0.325 | 0.195 |
| 4.973141170632472 | -0.252 | 0.325 | 0.196 |
| 4.976282763286062 | -0.255 | 0.324 | 0.197 |
| 4.979424355939651 | -0.258 | 0.324 | 0.198 |
| 4.982565948593241 | -0.261 | 0.324 | 0.199 |
| 4.985707541246831 | -0.263 | 0.323 | 0.2 |
| 4.98884913390042 | -0.266 | 0.323 | 0.201 |
| 4.99199072655401 | -0.269 | 0.322 | 0.202 |
| 4.9951323192076 | -0.272 | 0.322 | 0.203 |
| 4.99827391186119 | -0.275 | 0.321 | 0.204 |
| 5.00141550451478 | -0.277 | 0.321 | 0.205 |
| 5.004557097168369 | -0.28 | 0.32 | 0.206 |
| 5.007698689821958 | -0.283 | 0.32 | 0.207 |
| 5.010840282475548 | -0.286 | 0.319 | 0.207 |
| 5.013981875129137 | -0.288 | 0.319 | 0.208 |
| 5.017123467782727 | -0.291 | 0.318 | 0.209 |
| 5.020265060436317 | -0.294 | 0.318 | 0.21 |
| 5.023406653089906 | -0.296 | 0.317 | 0.21 |
| 5.026548245743496 | -0.299 | 0.316 | 0.211 |
| 5.029689838397085 | -0.302 | 0.316 | 0.211 |
| 5.032831431050674 | -0.305 | 0.315 | 0.212 |
| 5.035973023704264 | -0.307 | 0.314 | 0.213 |
| 5.039114616357854 | -0.31 | 0.314 | 0.213 |
| 5.042256209011444 | -0.313 | 0.313 | 0.214 |
| 5.045397801665033 | -0.315 | 0.312 | 0.214 |
| 5.048539394318622 | -0.318 | 0.311 | 0.215 |
| 5.051680986972213 | -0.321 | 0.311 | 0.215 |
| 5.054822579625802 | -0.323 | 0.31 | 0.216 |
| 5.057964172279392 | -0.326 | 0.309 | 0.216 |
| 5.061105764932981 | -0.328 | 0.308 | 0.216 |
| 5.064247357586571 | -0.331 | 0.307 | 0.217 |
| 5.067388950240161 | -0.334 | 0.306 | 0.217 |
| 5.07053054289375 | -0.336 | 0.306 | 0.218 |
| 5.07367213554734 | -0.339 | 0.305 | 0.218 |
| 5.07681372820093 | -0.341 | 0.304 | 0.218 |
| 5.079955320854519 | -0.344 | 0.303 | 0.219 |
| 5.083096913508108 | -0.346 | 0.302 | 0.219 |
| 5.086238506161698 | -0.349 | 0.301 | 0.219 |
| 5.089380098815288 | -0.351 | 0.3 | 0.219 |
| 5.092521691468877 | -0.354 | 0.299 | 0.22 |
| 5.095663284122466 | -0.357 | 0.298 | 0.22 |
| 5.098804876776057 | -0.359 | 0.297 | 0.22 |
| 5.101946469429646 | -0.362 | 0.296 | 0.22 |
| 5.105088062083236 | -0.364 | 0.295 | 0.22 |
| 5.108229654736825 | -0.366 | 0.294 | 0.221 |
| 5.111371247390415 | -0.369 | 0.292 | 0.221 |
| 5.114512840044005 | -0.371 | 0.291 | 0.221 |
| 5.117654432697594 | -0.374 | 0.29 | 0.221 |
| 5.120796025351184 | -0.376 | 0.289 | 0.221 |
| 5.123937618004773 | -0.379 | 0.288 | 0.221 |
| 5.127079210658363 | -0.381 | 0.286 | 0.221 |
| 5.130220803311953 | -0.384 | 0.285 | 0.221 |
| 5.133362395965542 | -0.386 | 0.284 | 0.221 |
| 5.136503988619131 | -0.388 | 0.282 | 0.222 |
| 5.13964558127272 | -0.391 | 0.281 | 0.222 |
| 5.142787173926311 | -0.393 | 0.28 | 0.222 |
| 5.1459287665799 | -0.395 | 0.278 | 0.222 |
| 5.14907035923349 | -0.398 | 0.277 | 0.222 |
| 5.15221195188708 | -0.4 | 0.276 | 0.222 |
| 5.15535354454067 | -0.402 | 0.274 | 0.222 |
| 5.158495137194259 | -0.405 | 0.273 | 0.222 |
| 5.161636729847848 | -0.407 | 0.271 | 0.222 |
| 5.164778322501438 | -0.409 | 0.27 | 0.222 |
| 5.167919915155028 | -0.412 | 0.268 | 0.222 |
| 5.171061507808617 | -0.414 | 0.267 | 0.222 |
| 5.174203100462206 | -0.416 | 0.265 | 0.222 |
| 5.177344693115796 | -0.418 | 0.263 | 0.222 |
| 5.180486285769386 | -0.421 | 0.262 | 0.222 |
| 5.183627878422976 | -0.423 | 0.26 | 0.222 |
| 5.186769471076565 | -0.425 | 0.258 | 0.222 |
| 5.189911063730155 | -0.427 | 0.257 | 0.222 |
| 5.193052656383744 | -0.429 | 0.255 | 0.222 |
| 5.196194249037334 | -0.432 | 0.253 | 0.222 |
| 5.199335841690924 | -0.434 | 0.251 | 0.222 |
| 5.202477434344513 | -0.436 | 0.25 | 0.222 |
| 5.205619026998103 | -0.438 | 0.248 | 0.222 |
| 5.208760619651692 | -0.44 | 0.246 | 0.222 |
| 5.211902212305282 | -0.442 | 0.244 | 0.222 |
| 5.215043804958871 | -0.444 | 0.242 | 0.222 |
| 5.218185397612461 | -0.447 | 0.24 | 0.222 |
| 5.221326990266051 | -0.449 | 0.238 | 0.222 |
| 5.22446858291964 | -0.451 | 0.236 | 0.222 |
| 5.22761017557323 | -0.453 | 0.235 | 0.222 |
| 5.23075176822682 | -0.455 | 0.233 | 0.222 |
| 5.23389336088041 | -0.457 | 0.231 | 0.222 |
| 5.237034953533999 | -0.459 | 0.228 | 0.222 |
| 5.240176546187588 | -0.461 | 0.226 | 0.222 |
| 5.243318138841178 | -0.463 | 0.224 | 0.222 |
| 5.246459731494767 | -0.465 | 0.222 | 0.222 |
| 5.249601324148357 | -0.467 | 0.22 | 0.222 |
| 5.252742916801947 | -0.469 | 0.218 | 0.222 |
| 5.255884509455536 | -0.471 | 0.216 | 0.222 |
| 5.259026102109125 | -0.473 | 0.214 | 0.222 |
| 5.262167694762715 | -0.475 | 0.211 | 0.222 |
| 5.265309287416305 | -0.477 | 0.209 | 0.222 |
| 5.268450880069895 | -0.479 | 0.207 | 0.222 |
| 5.271592472723484 | -0.481 | 0.205 | 0.222 |
| 5.274734065377074 | -0.483 | 0.202 | 0.222 |
| 5.277875658030664 | -0.485 | 0.2 | 0.222 |
| 5.281017250684253 | -0.486 | 0.198 | 0.222 |
| 5.284158843337843 | -0.488 | 0.195 | 0.222 |
| 5.287300435991432 | -0.49 | 0.193 | 0.222 |
| 5.290442028645022 | -0.492 | 0.191 | 0.222 |
| 5.293583621298612 | -0.494 | 0.188 | 0.222 |
| 5.296725213952201 | -0.496 | 0.186 | 0.222 |
| 5.299866806605791 | -0.498 | 0.183 | 0.222 |
| 5.30300839925938 | -0.499 | 0.181 | 0.222 |
| 5.30614999191297 | -0.501 | 0.178 | 0.222 |
| 5.30929158456656 | -0.503 | 0.176 | 0.222 |
| 5.312433177220149 | -0.505 | 0.173 | 0.222 |
| 5.315574769873739 | -0.506 | 0.171 | 0.222 |
| 5.318716362527328 | -0.508 | 0.168 | 0.222 |
| 5.321857955180918 | -0.51 | 0.165 | 0.222 |
| 5.324999547834508 | -0.512 | 0.163 | 0.222 |
| 5.328141140488097 | -0.513 | 0.16 | 0.222 |
| 5.331282733141686 | -0.515 | 0.158 | 0.222 |
| 5.334424325795276 | -0.517 | 0.155 | 0.222 |
| 5.337565918448866 | -0.518 | 0.152 | 0.222 |
| 5.340707511102456 | -0.52 | 0.15 | 0.221 |
| 5.343849103756045 | -0.522 | 0.147 | 0.221 |
| 5.346990696409634 | -0.523 | 0.144 | 0.221 |
| 5.350132289063224 | -0.525 | 0.141 | 0.221 |
| 5.353273881716814 | -0.527 | 0.139 | 0.221 |
| 5.356415474370403 | -0.528 | 0.136 | 0.221 |
| 5.359557067023993 | -0.53 | 0.133 | 0.221 |
| 5.362698659677583 | -0.531 | 0.13 | 0.221 |
| 5.365840252331172 | -0.533 | 0.127 | 0.22 |
| 5.368981844984762 | -0.535 | 0.125 | 0.22 |
| 5.372123437638351 | -0.536 | 0.122 | 0.22 |
| 5.375265030291941 | -0.538 | 0.119 | 0.22 |
| 5.378406622945531 | -0.539 | 0.116 | 0.22 |
| 5.38154821559912 | -0.541 | 0.113 | 0.219 |
| 5.38468980825271 | -0.542 | 0.11 | 0.219 |
| 5.387831400906299 | -0.544 | 0.107 | 0.219 |
| 5.39097299355989 | -0.545 | 0.104 | 0.219 |
| 5.394114586213479 | -0.547 | 0.101 | 0.218 |
| 5.397256178867068 | -0.548 | 0.099 | 0.218 |
| 5.400397771520657 | -0.55 | 0.096 | 0.218 |
| 5.403539364174247 | -0.551 | 0.093 | 0.217 |
| 5.406680956827837 | -0.553 | 0.09 | 0.217 |
| 5.409822549481426 | -0.554 | 0.087 | 0.217 |
| 5.412964142135016 | -0.555 | 0.084 | 0.216 |
| 5.416105734788605 | -0.557 | 0.081 | 0.216 |
| 5.419247327442195 | -0.558 | 0.078 | 0.215 |
| 5.422388920095785 | -0.56 | 0.075 | 0.215 |
| 5.425530512749375 | -0.561 | 0.072 | 0.214 |
| 5.428672105402964 | -0.562 | 0.068 | 0.214 |
| 5.431813698056554 | -0.564 | 0.065 | 0.213 |
| 5.434955290710143 | -0.565 | 0.062 | 0.213 |
| 5.438096883363733 | -0.566 | 0.059 | 0.212 |
| 5.441238476017322 | -0.568 | 0.056 | 0.212 |
| 5.444380068670912 | -0.569 | 0.053 | 0.211 |
| 5.447521661324502 | -0.57 | 0.05 | 0.21 |
| 5.450663253978091 | -0.571 | 0.047 | 0.21 |
| 5.453804846631681 | -0.573 | 0.044 | 0.209 |
| 5.456946439285271 | -0.574 | 0.041 | 0.208 |
| 5.46008803193886 | -0.575 | 0.038 | 0.208 |
| 5.46322962459245 | -0.576 | 0.034 | 0.207 |
| 5.466371217246039 | -0.578 | 0.031 | 0.206 |
| 5.46951280989963 | -0.579 | 0.028 | 0.205 |
| 5.472654402553218 | -0.58 | 0.025 | 0.204 |
| 5.475795995206808 | -0.581 | 0.022 | 0.203 |
| 5.478937587860398 | -0.582 | 0.019 | 0.203 |
| 5.482079180513987 | -0.584 | 0.016 | 0.202 |
| 5.485220773167577 | -0.585 | 0.013 | 0.201 |
| 5.488362365821166 | -0.586 | 0.009 | 0.2 |
| 5.491503958474756 | -0.587 | 0.006 | 0.199 |
| 5.494645551128346 | -0.588 | 0.003 | 0.198 |
| 5.497787143781935 | -0.589 | 0 | 0.196 |
| 5.500928736435525 | -0.59 | -0.003 | 0.195 |
| 5.504070329089115 | -0.591 | -0.006 | 0.194 |
| 5.507211921742704 | -0.593 | -0.009 | 0.193 |
| 5.510353514396294 | -0.594 | -0.013 | 0.192 |
| 5.513495107049883 | -0.595 | -0.016 | 0.19 |
| 5.516636699703473 | -0.596 | -0.019 | 0.189 |
| 5.519778292357062 | -0.597 | -0.022 | 0.188 |
| 5.522919885010652 | -0.598 | -0.025 | 0.187 |
| 5.526061477664242 | -0.599 | -0.028 | 0.185 |
| 5.529203070317831 | -0.6 | -0.031 | 0.184 |
| 5.532344662971421 | -0.601 | -0.034 | 0.182 |
| 5.535486255625011 | -0.602 | -0.038 | 0.181 |
| 5.5386278482786 | -0.603 | -0.041 | 0.179 |
| 5.54176944093219 | -0.604 | -0.044 | 0.178 |
| 5.544911033585779 | -0.605 | -0.047 | 0.176 |
| 5.54805262623937 | -0.606 | -0.05 | 0.174 |
| 5.551194218892959 | -0.607 | -0.053 | 0.173 |
| 5.554335811546548 | -0.608 | -0.056 | 0.171 |
| 5.557477404200137 | -0.609 | -0.059 | 0.169 |
| 5.560618996853727 | -0.609 | -0.062 | 0.168 |
| 5.563760589507317 | -0.61 | -0.065 | 0.166 |
| 5.566902182160906 | -0.611 | -0.068 | 0.164 |
| 5.570043774814496 | -0.612 | -0.072 | 0.162 |
| 5.573185367468086 | -0.613 | -0.075 | 0.16 |
| 5.576326960121675 | -0.614 | -0.078 | 0.158 |
| 5.579468552775264 | -0.615 | -0.081 | 0.156 |
| 5.582610145428854 | -0.616 | -0.084 | 0.154 |
| 5.585751738082444 | -0.616 | -0.087 | 0.152 |
| 5.588893330736034 | -0.617 | -0.09 | 0.15 |
| 5.592034923389623 | -0.618 | -0.093 | 0.148 |
| 5.595176516043213 | -0.619 | -0.096 | 0.146 |
| 5.598318108696803 | -0.62 | -0.099 | 0.144 |
| 5.601459701350392 | -0.62 | -0.101 | 0.142 |
| 5.604601294003982 | -0.621 | -0.104 | 0.139 |
| 5.607742886657571 | -0.622 | -0.107 | 0.137 |
| 5.610884479311161 | -0.623 | -0.11 | 0.135 |
| 5.61402607196475 | -0.624 | -0.113 | 0.133 |
| 5.61716766461834 | -0.624 | -0.116 | 0.13 |
| 5.62030925727193 | -0.625 | -0.119 | 0.128 |
| 5.623450849925519 | -0.626 | -0.122 | 0.125 |
| 5.626592442579109 | -0.626 | -0.125 | 0.123 |
| 5.629734035232698 | -0.627 | -0.127 | 0.121 |
| 5.632875627886288 | -0.628 | -0.13 | 0.118 |
| 5.636017220539878 | -0.629 | -0.133 | 0.115 |
| 5.639158813193467 | -0.629 | -0.136 | 0.113 |
| 5.642300405847057 | -0.63 | -0.139 | 0.11 |
| 5.645441998500646 | -0.631 | -0.141 | 0.108 |
| 5.648583591154236 | -0.631 | -0.144 | 0.105 |
| 5.651725183807825 | -0.632 | -0.147 | 0.102 |
| 5.654866776461415 | -0.633 | -0.15 | 0.1 |
| 5.658008369115005 | -0.633 | -0.152 | 0.097 |
| 5.661149961768594 | -0.634 | -0.155 | 0.094 |
| 5.664291554422184 | -0.634 | -0.158 | 0.092 |
| 5.667433147075774 | -0.635 | -0.16 | 0.089 |
| 5.670574739729363 | -0.636 | -0.163 | 0.086 |
| 5.673716332382953 | -0.636 | -0.165 | 0.083 |
| 5.676857925036542 | -0.637 | -0.168 | 0.08 |
| 5.679999517690132 | -0.637 | -0.171 | 0.077 |
| 5.683141110343721 | -0.638 | -0.173 | 0.074 |
| 5.686282702997311 | -0.638 | -0.176 | 0.072 |
| 5.689424295650901 | -0.639 | -0.178 | 0.069 |
| 5.69256588830449 | -0.64 | -0.181 | 0.066 |
| 5.69570748095808 | -0.64 | -0.183 | 0.063 |
| 5.69884907361167 | -0.641 | -0.186 | 0.06 |
| 5.701990666265259 | -0.641 | -0.188 | 0.057 |
| 5.705132258918849 | -0.642 | -0.191 | 0.054 |
| 5.708273851572438 | -0.642 | -0.193 | 0.051 |
| 5.711415444226028 | -0.643 | -0.195 | 0.048 |
| 5.714557036879618 | -0.643 | -0.198 | 0.045 |
| 5.717698629533207 | -0.644 | -0.2 | 0.042 |
| 5.720840222186797 | -0.644 | -0.202 | 0.038 |
| 5.723981814840386 | -0.645 | -0.205 | 0.035 |
| 5.727123407493976 | -0.645 | -0.207 | 0.032 |
| 5.730265000147565 | -0.646 | -0.209 | 0.029 |
| 5.733406592801155 | -0.646 | -0.211 | 0.026 |
| 5.736548185454744 | -0.646 | -0.214 | 0.023 |
| 5.739689778108334 | -0.647 | -0.216 | 0.02 |
| 5.742831370761924 | -0.647 | -0.218 | 0.017 |
| 5.745972963415514 | -0.648 | -0.22 | 0.014 |
| 5.749114556069103 | -0.648 | -0.222 | 0.01 |
| 5.752256148722693 | -0.649 | -0.224 | 0.007 |
| 5.755397741376282 | -0.649 | -0.226 | 0.004 |
| 5.758539334029872 | -0.649 | -0.228 | 0.001 |
| 5.761680926683462 | -0.65 | -0.231 | -0.002 |
| 5.764822519337051 | -0.65 | -0.233 | -0.005 |
| 5.767964111990641 | -0.651 | -0.235 | -0.008 |
| 5.77110570464423 | -0.651 | -0.236 | -0.012 |
| 5.77424729729782 | -0.651 | -0.238 | -0.015 |
| 5.77738888995141 | -0.652 | -0.24 | -0.018 |
| 5.780530482605 | -0.652 | -0.242 | -0.021 |
| 5.783672075258588 | -0.652 | -0.244 | -0.024 |
| 5.786813667912178 | -0.653 | -0.246 | -0.027 |
| 5.789955260565768 | -0.653 | -0.248 | -0.03 |
| 5.793096853219358 | -0.653 | -0.25 | -0.033 |
| 5.796238445872947 | -0.654 | -0.251 | -0.036 |
| 5.799380038526537 | -0.654 | -0.253 | -0.04 |
| 5.802521631180126 | -0.654 | -0.255 | -0.043 |
| 5.805663223833715 | -0.655 | -0.257 | -0.046 |
| 5.808804816487306 | -0.655 | -0.258 | -0.049 |
| 5.811946409140895 | -0.655 | -0.26 | -0.052 |
| 5.815088001794485 | -0.656 | -0.262 | -0.055 |
| 5.818229594448074 | -0.656 | -0.263 | -0.058 |
| 5.821371187101663 | -0.656 | -0.265 | -0.061 |
| 5.824512779755254 | -0.656 | -0.267 | -0.064 |
| 5.827654372408843 | -0.657 | -0.268 | -0.067 |
| 5.830795965062433 | -0.657 | -0.27 | -0.07 |
| 5.833937557716022 | -0.657 | -0.271 | -0.073 |
| 5.837079150369612 | -0.657 | -0.273 | -0.075 |
| 5.840220743023201 | -0.658 | -0.274 | -0.078 |
| 5.843362335676791 | -0.658 | -0.276 | -0.081 |
| 5.846503928330381 | -0.658 | -0.277 | -0.084 |
| 5.84964552098397 | -0.658 | -0.278 | -0.087 |
| 5.85278711363756 | -0.659 | -0.28 | -0.09 |
| 5.85592870629115 | -0.659 | -0.281 | -0.092 |
| 5.85907029894474 | -0.659 | -0.282 | -0.095 |
| 5.862211891598329 | -0.659 | -0.284 | -0.098 |
| 5.865353484251918 | -0.659 | -0.285 | -0.101 |
| 5.868495076905508 | -0.66 | -0.286 | -0.103 |
| 5.871636669559098 | -0.66 | -0.288 | -0.106 |
| 5.874778262212687 | -0.66 | -0.289 | -0.109 |
| 5.877919854866277 | -0.66 | -0.29 | -0.111 |
| 5.881061447519866 | -0.66 | -0.291 | -0.114 |
| 5.884203040173456 | -0.661 | -0.292 | -0.116 |
| 5.887344632827046 | -0.661 | -0.294 | -0.119 |
| 5.890486225480635 | -0.661 | -0.295 | -0.121 |
| 5.893627818134224 | -0.661 | -0.296 | -0.124 |
| 5.896769410787814 | -0.661 | -0.297 | -0.126 |
| 5.899911003441404 | -0.662 | -0.298 | -0.129 |
| 5.903052596094994 | -0.662 | -0.299 | -0.131 |
| 5.906194188748583 | -0.662 | -0.3 | -0.133 |
| 5.909335781402172 | -0.662 | -0.301 | -0.136 |
| 5.912477374055762 | -0.662 | -0.302 | -0.138 |
| 5.915618966709352 | -0.662 | -0.303 | -0.14 |
| 5.918760559362942 | -0.662 | -0.304 | -0.142 |
| 5.921902152016531 | -0.663 | -0.305 | -0.145 |
| 5.92504374467012 | -0.663 | -0.306 | -0.147 |
| 5.92818533732371 | -0.663 | -0.306 | -0.149 |
| 5.9313269299773 | -0.663 | -0.307 | -0.151 |
| 5.93446852263089 | -0.663 | -0.308 | -0.153 |
| 5.93761011528448 | -0.663 | -0.309 | -0.155 |
| 5.940751707938068 | -0.663 | -0.31 | -0.157 |
| 5.943893300591658 | -0.663 | -0.311 | -0.159 |
| 5.947034893245248 | -0.664 | -0.311 | -0.161 |
| 5.950176485898837 | -0.664 | -0.312 | -0.163 |
| 5.953318078552427 | -0.664 | -0.313 | -0.165 |
| 5.956459671206017 | -0.664 | -0.314 | -0.166 |
| 5.959601263859606 | -0.664 | -0.314 | -0.168 |
| 5.962742856513196 | -0.664 | -0.315 | -0.17 |
| 5.965884449166785 | -0.664 | -0.316 | -0.172 |
| 5.969026041820375 | -0.664 | -0.316 | -0.173 |
| 5.972167634473964 | -0.664 | -0.317 | -0.175 |
| 5.975309227127554 | -0.664 | -0.318 | -0.177 |
| 5.978450819781144 | -0.665 | -0.318 | -0.178 |
| 5.981592412434733 | -0.665 | -0.319 | -0.18 |
| 5.984734005088323 | -0.665 | -0.319 | -0.181 |
| 5.987875597741913 | -0.665 | -0.32 | -0.183 |
| 5.991017190395502 | -0.665 | -0.32 | -0.184 |
| 5.994158783049092 | -0.665 | -0.321 | -0.186 |
| 5.997300375702681 | -0.665 | -0.321 | -0.187 |
| 6.000441968356271 | -0.665 | -0.322 | -0.188 |
| 6.003583561009861 | -0.665 | -0.322 | -0.19 |
| 6.00672515366345 | -0.665 | -0.323 | -0.191 |
| 6.00986674631704 | -0.665 | -0.323 | -0.192 |
| 6.01300833897063 | -0.665 | -0.324 | -0.193 |
| 6.01614993162422 | -0.665 | -0.324 | -0.195 |
| 6.019291524277808 | -0.665 | -0.324 | -0.196 |
| 6.022433116931398 | -0.666 | -0.325 | -0.197 |
| 6.025574709584988 | -0.666 | -0.325 | -0.198 |
| 6.028716302238577 | -0.666 | -0.326 | -0.199 |
| 6.031857894892167 | -0.666 | -0.326 | -0.2 |
| 6.034999487545757 | -0.666 | -0.326 | -0.201 |
| 6.038141080199346 | -0.666 | -0.327 | -0.202 |
| 6.041282672852935 | -0.666 | -0.327 | -0.203 |
| 6.044424265506525 | -0.666 | -0.327 | -0.204 |
| 6.047565858160115 | -0.666 | -0.328 | -0.205 |
| 6.050707450813704 | -0.666 | -0.328 | -0.205 |
| 6.053849043467294 | -0.666 | -0.328 | -0.206 |
| 6.056990636120884 | -0.666 | -0.328 | -0.207 |
| 6.060132228774473 | -0.666 | -0.329 | -0.208 |
| 6.063273821428063 | -0.666 | -0.329 | -0.209 |
| 6.066415414081653 | -0.666 | -0.329 | -0.209 |
| 6.069557006735242 | -0.666 | -0.329 | -0.21 |
| 6.072698599388831 | -0.666 | -0.33 | -0.211 |
| 6.07584019204242 | -0.666 | -0.33 | -0.211 |
| 6.078981784696011 | -0.666 | -0.33 | -0.212 |
| 6.082123377349601 | -0.666 | -0.33 | -0.212 |
| 6.08526497000319 | -0.666 | -0.33 | -0.213 |
| 6.08840656265678 | -0.666 | -0.331 | -0.214 |
| 6.09154815531037 | -0.666 | -0.331 | -0.214 |
| 6.094689747963959 | -0.666 | -0.331 | -0.215 |
| 6.097831340617549 | -0.666 | -0.331 | -0.215 |
| 6.100972933271138 | -0.666 | -0.331 | -0.215 |
| 6.104114525924728 | -0.666 | -0.331 | -0.216 |
| 6.107256118578317 | -0.666 | -0.331 | -0.216 |
| 6.110397711231907 | -0.666 | -0.332 | -0.217 |
| 6.113539303885497 | -0.666 | -0.332 | -0.217 |
| 6.116680896539086 | -0.666 | -0.332 | -0.217 |
| 6.119822489192675 | -0.666 | -0.332 | -0.218 |
| 6.122964081846265 | -0.667 | -0.332 | -0.218 |
| 6.126105674499855 | -0.667 | -0.332 | -0.218 |
| 6.129247267153445 | -0.667 | -0.332 | -0.219 |
| 6.132388859807034 | -0.667 | -0.332 | -0.219 |
| 6.135530452460624 | -0.667 | -0.332 | -0.219 |
| 6.138672045114213 | -0.667 | -0.332 | -0.219 |
| 6.141813637767803 | -0.667 | -0.333 | -0.22 |
| 6.144955230421393 | -0.667 | -0.333 | -0.22 |
| 6.148096823074982 | -0.667 | -0.333 | -0.22 |
| 6.151238415728571 | -0.667 | -0.333 | -0.22 |
| 6.154380008382161 | -0.667 | -0.333 | -0.22 |
| 6.157521601035751 | -0.667 | -0.333 | -0.221 |
| 6.16066319368934 | -0.667 | -0.333 | -0.221 |
| 6.16380478634293 | -0.667 | -0.333 | -0.221 |
| 6.16694637899652 | -0.667 | -0.333 | -0.221 |
| 6.170087971650109 | -0.667 | -0.333 | -0.221 |
| 6.173229564303698 | -0.667 | -0.333 | -0.221 |
| 6.176371156957289 | -0.667 | -0.333 | -0.221 |
| 6.179512749610878 | -0.667 | -0.333 | -0.221 |
| 6.182654342264468 | -0.667 | -0.333 | -0.222 |
| 6.185795934918057 | -0.667 | -0.333 | -0.222 |
| 6.188937527571647 | -0.667 | -0.333 | -0.222 |
| 6.192079120225237 | -0.667 | -0.333 | -0.222 |
| 6.195220712878826 | -0.667 | -0.333 | -0.222 |
| 6.198362305532415 | -0.667 | -0.333 | -0.222 |
| 6.201503898186005 | -0.667 | -0.333 | -0.222 |
| 6.204645490839594 | -0.667 | -0.333 | -0.222 |
| 6.207787083493184 | -0.667 | -0.333 | -0.222 |
| 6.210928676146774 | -0.667 | -0.333 | -0.222 |
| 6.214070268800364 | -0.667 | -0.333 | -0.222 |
| 6.217211861453953 | -0.667 | -0.333 | -0.222 |
| 6.220353454107543 | -0.667 | -0.333 | -0.222 |
| 6.223495046761133 | -0.667 | -0.333 | -0.222 |
| 6.226636639414722 | -0.667 | -0.333 | -0.222 |
| 6.229778232068312 | -0.667 | -0.333 | -0.222 |
| 6.232919824721901 | -0.667 | -0.333 | -0.222 |
| 6.236061417375491 | -0.667 | -0.333 | -0.222 |
| 6.23920301002908 | -0.667 | -0.333 | -0.222 |
| 6.24234460268267 | -0.667 | -0.333 | -0.222 |
| 6.24548619533626 | -0.667 | -0.333 | -0.222 |
| 6.24862778798985 | -0.667 | -0.333 | -0.222 |
| 6.251769380643438 | -0.667 | -0.333 | -0.222 |
| 6.254910973297028 | -0.667 | -0.333 | -0.222 |
| 6.258052565950618 | -0.667 | -0.333 | -0.222 |
| 6.261194158604208 | -0.667 | -0.333 | -0.222 |
| 6.264335751257797 | -0.667 | -0.333 | -0.222 |
| 6.267477343911387 | -0.667 | -0.333 | -0.222 |
| 6.270618936564976 | -0.667 | -0.333 | -0.222 |
| 6.273760529218566 | -0.667 | -0.333 | -0.222 |
| 6.276902121872155 | -0.667 | -0.333 | -0.222 |
| 6.280043714525745 | -0.667 | -0.333 | -0.222 |
| 6.283185307179335 | -0.667 | -0.333 | -0.222 |